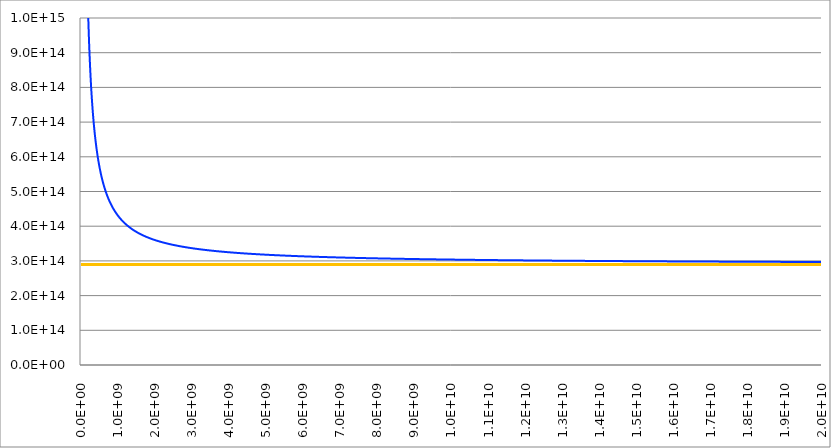
| Category | Series 1 | Series 0 | Series 2 | Series 3 |
|---|---|---|---|---|
| 0.0 |  |  | 9460730472580800 | 289759260980622 |
| 10000000.0 |  |  | 6940371603818580 | 289759260980622 |
| 20000000.0 |  |  | 5250958978916320 | 289759260980622 |
| 30000000.0 |  |  | 4141010980290260 | 289759260980622 |
| 40000000.0 |  |  | 3394667896250070 | 289759260980622 |
| 50000000.0 |  |  | 2872714647851440 | 289759260980622 |
| 60000000.0 |  |  | 2492768417914960 | 289759260980622 |
| 70000000.0 |  |  | 2206181239357440 | 289759260980622 |
| 80000000.0 |  |  | 1983395692493420 | 289759260980622 |
| 90000000.0 |  |  | 1805778403562200 | 289759260980622 |
| 100000000.0 |  |  | 1661141711476920 | 289759260980622 |
| 110000000.0 |  |  | 1541238857798990 | 289759260980622 |
| 120000000.0 |  |  | 1440318104584080 | 289759260980622 |
| 130000000.0 |  |  | 1354259187466300 | 289759260980622 |
| 140000000.0 |  |  | 1280040254891900 | 289759260980622 |
| 150000000.0 |  |  | 1215398567079100 | 289759260980622 |
| 160000000.0 |  |  | 1158608400531650 | 289759260980622 |
| 170000000.0 |  |  | 1108331944488980 | 289759260980622 |
| 180000000.0 |  |  | 1063516885940020 | 289759260980622 |
| 190000000.0 |  |  | 1023324596046940 | 289759260980622 |
| 200000000.0 |  |  | 987078824555616 | 289759260980622 |
| 210000000.0 |  |  | 954228418999640 | 289759260980622 |
| 220000000.0 |  |  | 924319813813488 | 289759260980622 |
| 230000000.0 |  |  | 896976441207608 | 289759260980622 |
| 240000000.0 |  |  | 871883122412320 | 289759260980622 |
| 250000000.0 |  |  | 848774093707264 | 289759260980622 |
| 260000000.0 |  |  | 827423720154176 | 289759260980622 |
| 270000000.0 |  |  | 807639220895072 | 289759260980622 |
| 280000000.0 |  |  | 789254916915488 | 289759260980622 |
| 290000000.0 |  |  | 772127643125392 | 289759260980622 |
| 300000000.0 |  |  | 756133059506064 | 289759260980622 |
| 310000000.0 |  |  | 741162662781840 | 289759260980622 |
| 320000000.0 |  |  | 727121348532128 | 289759260980622 |
| 330000000.0 |  |  | 713925409235968 | 289759260980622 |
| 340000000.0 |  |  | 701500880122128 | 289759260980622 |
| 350000000.0 |  |  | 689782164447776 | 289759260980622 |
| 360000000.0 |  |  | 678710884743840 | 289759260980622 |
| 370000000.0 |  |  | 668234917923184 | 289759260980622 |
| 380000000.0 |  |  | 658307580866640 | 289759260980622 |
| 390000000.0 |  |  | 648886939844368 | 289759260980622 |
| 400000000.0 |  |  | 639935222378784 | 289759260980622 |
| 410000000.0 |  |  | 631418314273120 | 289759260980622 |
| 420000000.0 |  |  | 623305327775328 | 289759260980622 |
| 430000000.0 |  |  | 615568229425264 | 289759260980622 |
| 440000000.0 |  |  | 608181518189552 | 289759260980622 |
| 450000000.0 |  |  | 601121946140768 | 289759260980622 |
| 460000000.0 |  |  | 594368275268032 | 289759260980622 |
| 470000000.0 |  |  | 587901065087584 | 289759260980622 |
| 480000000.0 |  |  | 581702486601088 | 289759260980622 |
| 490000000.0 |  |  | 575756158869088 | 289759260980622 |
| 500000000.0 |  |  | 570047005058944 | 289759260980622 |
| 510000000.0 |  |  | 564561125315424 | 289759260980622 |
| 520000000.0 |  |  | 559285684205696 | 289759260980622 |
| 530000000.0 |  |  | 554208810827648 | 289759260980622 |
| 540000000.0 |  |  | 549319509951584 | 289759260980622 |
| 550000000.0 |  |  | 544607582799712 | 289759260980622 |
| 560000000.0 |  |  | 540063556267232 | 289759260980622 |
| 570000000.0 |  |  | 535678619553568 | 289759260980622 |
| 580000000.0 |  |  | 531444567316352 | 289759260980622 |
| 590000000.0 |  |  | 527353748576480 | 289759260980622 |
| 600000000.0 |  |  | 523399020709152 | 289759260980622 |
| 610000000.0 |  |  | 519573707939360 | 289759260980622 |
| 620000000.0 |  |  | 515871563835296 | 289759260980622 |
| 630000000.0 |  |  | 512286737359200 | 289759260980622 |
| 640000000.0 |  |  | 508813742086976 | 289759260980622 |
| 650000000.0 |  |  | 505447428258016 | 289759260980622 |
| 660000000.0 |  |  | 502182957355392 | 289759260980622 |
| 670000000.0 |  |  | 499015778954368 | 289759260980622 |
| 680000000.0 |  |  | 495941609605696 | 289759260980622 |
| 690000000.0 |  |  | 492956413548544 | 289759260980622 |
| 700000000.0 |  |  | 490056385071328 | 289759260980622 |
| 710000000.0 |  |  | 487237932357376 | 289759260980622 |
| 720000000.0 |  |  | 484497662672992 | 289759260980622 |
| 730000000.0 |  |  | 481832368768704 | 289759260980622 |
| 740000000.0 |  |  | 479239016379776 | 289759260980622 |
| 750000000.0 |  |  | 476714732723616 | 289759260980622 |
| 760000000.0 |  |  | 474256795902624 | 289759260980622 |
| 770000000.0 |  |  | 471862625130464 | 289759260980622 |
| 780000000.0 |  |  | 469529771707840 | 289759260980622 |
| 790000000.0 |  |  | 467255910682368 | 289759260980622 |
| 800000000.0 |  |  | 465038833131264 | 289759260980622 |
| 810000000.0 |  |  | 462876439015488 | 289759260980622 |
| 820000000.0 |  |  | 460766730554240 | 289759260980622 |
| 830000000.0 |  |  | 458707806078112 | 289759260980622 |
| 840000000.0 |  |  | 456697854319648 | 289759260980622 |
| 850000000.0 |  |  | 454735149106368 | 289759260980622 |
| 860000000.0 |  |  | 452818044423104 | 289759260980622 |
| 870000000.0 |  |  | 450944969813728 | 289759260980622 |
| 880000000.0 |  |  | 449114426096448 | 289759260980622 |
| 890000000.0 |  |  | 447324981366688 | 289759260980622 |
| 900000000.0 |  |  | 445575267266144 | 289759260980622 |
| 910000000.0 |  |  | 443863975497312 | 289759260980622 |
| 920000000.0 |  |  | 442189854564992 | 289759260980622 |
| 930000000.0 |  |  | 440551706727200 | 289759260980622 |
| 940000000.0 |  |  | 438948385141088 | 289759260980622 |
| 950000000.0 |  |  | 437378791187808 | 289759260980622 |
| 960000000.0 |  |  | 435841871965056 | 289759260980622 |
| 970000000.0 |  |  | 434336617934208 | 289759260980622 |
| 980000000.0 |  |  | 432862060711168 | 289759260980622 |
| 990000000.0 |  |  | 431417270990464 | 289759260980622 |
| 1000000000.0 |  |  | 430001356595008 | 289759260980622 |
| 1010000000.0 |  |  | 428613460639616 | 289759260980622 |
| 1020000000.0 |  |  | 427252759804480 | 289759260980622 |
| 1030000000.0 |  |  | 425918462707264 | 289759260980622 |
| 1040000000.0 |  |  | 424609808369408 | 289759260980622 |
| 1050000000.0 |  |  | 423326064771456 | 289759260980622 |
| 1060000000.0 |  |  | 422066527487552 | 289759260980622 |
| 1070000000.0 |  |  | 420830518398016 | 289759260980622 |
| 1080000000.0 |  |  | 419617384473472 | 289759260980622 |
| 1090000000.0 |  |  | 418426496624768 | 289759260980622 |
| 1100000000.0 |  |  | 417257248615872 | 289759260980622 |
| 1110000000.0 |  |  | 416109056036480 | 289759260980622 |
| 1120000000.0 |  |  | 414981355328000 | 289759260980622 |
| 1130000000.0 |  |  | 413873602862080 | 289759260980622 |
| 1140000000.0 |  |  | 412785274068096 | 289759260980622 |
| 1150000000.0 |  |  | 411715862604416 | 289759260980622 |
| 1160000000.0 |  |  | 410664879574272 | 289759260980622 |
| 1170000000.0 |  |  | 409631852780736 | 289759260980622 |
| 1180000000.0 |  |  | 408616326020096 | 289759260980622 |
| 1190000000.0 |  |  | 407617858409792 | 289759260980622 |
| 1200000000.0 |  |  | 406636023751872 | 289759260980622 |
| 1210000000.0 |  |  | 405670409925696 | 289759260980622 |
| 1220000000.0 |  |  | 404720618312192 | 289759260980622 |
| 1230000000.0 |  |  | 403786263245248 | 289759260980622 |
| 1240000000.0 |  |  | 402866971489856 | 289759260980622 |
| 1250000000.0 |  |  | 401962381745728 | 289759260980622 |
| 1260000000.0 |  |  | 401072144173632 | 289759260980622 |
| 1270000000.0 |  |  | 400195919944960 | 289759260980622 |
| 1280000000.0 |  |  | 399333380811392 | 289759260980622 |
| 1290000000.0 |  |  | 398484208696192 | 289759260980622 |
| 1300000000.0 |  |  | 397648095302400 | 289759260980622 |
| 1310000000.0 |  |  | 396824741739968 | 289759260980622 |
| 1320000000.0 |  |  | 396013858170432 | 289759260980622 |
| 1330000000.0 |  |  | 395215163466176 | 289759260980622 |
| 1340000000.0 |  |  | 394428384885824 | 289759260980622 |
| 1350000000.0 |  |  | 393653257764160 | 289759260980622 |
| 1360000000.0 |  |  | 392889525215104 | 289759260980622 |
| 1370000000.0 |  |  | 392136937848064 | 289759260980622 |
| 1380000000.0 |  |  | 391395253496960 | 289759260980622 |
| 1390000000.0 |  |  | 390664236960128 | 289759260980622 |
| 1400000000.0 |  |  | 389943659751616 | 289759260980622 |
| 1410000000.0 |  |  | 389233299863744 | 289759260980622 |
| 1420000000.0 |  |  | 388532941538944 | 289759260980622 |
| 1430000000.0 |  |  | 387842375051136 | 289759260980622 |
| 1440000000.0 |  |  | 387161396496704 | 289759260980622 |
| 1450000000.0 |  |  | 386489807593920 | 289759260980622 |
| 1460000000.0 |  |  | 385827415490112 | 289759260980622 |
| 1470000000.0 |  |  | 385174032577600 | 289759260980622 |
| 1480000000.0 |  |  | 384529476316608 | 289759260980622 |
| 1490000000.0 |  |  | 383893569064832 | 289759260980622 |
| 1500000000.0 |  |  | 383266137914688 | 289759260980622 |
| 1510000000.0 |  |  | 382647014536832 | 289759260980622 |
| 1520000000.0 |  |  | 382036035028800 | 289759260980622 |
| 1530000000.0 |  |  | 381433039771456 | 289759260980622 |
| 1540000000.0 |  |  | 380837873289536 | 289759260980622 |
| 1550000000.0 |  |  | 380250384117696 | 289759260980622 |
| 1560000000.0 |  |  | 379670424672832 | 289759260980622 |
| 1570000000.0 |  |  | 379097851129984 | 289759260980622 |
| 1580000000.0 |  |  | 378532523303360 | 289759260980622 |
| 1590000000.0 |  |  | 377974304532544 | 289759260980622 |
| 1600000000.0 |  |  | 377423061571968 | 289759260980622 |
| 1610000000.0 |  |  | 376878664484736 | 289759260980622 |
| 1620000000.0 |  |  | 376340986541248 | 289759260980622 |
| 1630000000.0 |  |  | 375809904120064 | 289759260980622 |
| 1640000000.0 |  |  | 375285296613888 | 289759260980622 |
| 1650000000.0 |  |  | 374767046337664 | 289759260980622 |
| 1660000000.0 |  |  | 374255038441216 | 289759260980622 |
| 1670000000.0 |  |  | 373749160823744 | 289759260980622 |
| 1680000000.0 |  |  | 373249304052864 | 289759260980622 |
| 1690000000.0 |  |  | 372755361284736 | 289759260980622 |
| 1700000000.0 |  |  | 372267228188736 | 289759260980622 |
| 1710000000.0 |  |  | 371784802873728 | 289759260980622 |
| 1720000000.0 |  |  | 371307985817216 | 289759260980622 |
| 1730000000.0 |  |  | 370836679796736 | 289759260980622 |
| 1740000000.0 |  |  | 370370789824064 | 289759260980622 |
| 1750000000.0 |  |  | 369910223081216 | 289759260980622 |
| 1760000000.0 |  |  | 369454888859008 | 289759260980622 |
| 1770000000.0 |  |  | 369004698497344 | 289759260980622 |
| 1780000000.0 |  |  | 368559565328000 | 289759260980622 |
| 1790000000.0 |  |  | 368119404618176 | 289759260980622 |
| 1800000000.0 |  |  | 367684133517760 | 289759260980622 |
| 1810000000.0 |  |  | 367253671007040 | 289759260980622 |
| 1820000000.0 |  |  | 366827937845824 | 289759260980622 |
| 1830000000.0 |  |  | 366406856525824 | 289759260980622 |
| 1840000000.0 |  |  | 365990351222976 | 289759260980622 |
| 1850000000.0 |  |  | 365578347751872 | 289759260980622 |
| 1860000000.0 |  |  | 365170773522240 | 289759260980622 |
| 1870000000.0 |  |  | 364767557495872 | 289759260980622 |
| 1880000000.0 |  |  | 364368630145536 | 289759260980622 |
| 1890000000.0 |  |  | 363973923414912 | 289759260980622 |
| 1900000000.0 |  |  | 363583370680256 | 289759260980622 |
| 1910000000.0 |  |  | 363196906712064 | 289759260980622 |
| 1920000000.0 |  |  | 362814467640000 | 289759260980622 |
| 1930000000.0 |  |  | 362435990916736 | 289759260980622 |
| 1940000000.0 |  |  | 362061415283968 | 289759260980622 |
| 1950000000.0 |  |  | 361690680740096 | 289759260980622 |
| 1960000000.0 |  |  | 361323728507136 | 289759260980622 |
| 1970000000.0 |  |  | 360960501000448 | 289759260980622 |
| 1980000000.0 |  |  | 360600941798400 | 289759260980622 |
| 1990000000.0 |  |  | 360244995613440 | 289759260980622 |
| 2000000000.0 |  |  | 359892608262400 | 289759260980622 |
| 2010000000.0 |  |  | 359543726641152 | 289759260980622 |
| 2020000000.0 |  |  | 359198298696448 | 289759260980622 |
| 2030000000.0 |  |  | 358856273400576 | 289759260980622 |
| 2040000000.0 |  |  | 358517600725248 | 289759260980622 |
| 2050000000.0 |  |  | 358182231619328 | 289759260980622 |
| 2060000000.0 |  |  | 357850117983232 | 289759260980622 |
| 2070000000.0 |  |  | 357521212646144 | 289759260980622 |
| 2080000000.0 |  |  | 357195469345280 | 289759260980622 |
| 2090000000.0 |  |  | 356872842702080 | 289759260980622 |
| 2100000000.0 |  |  | 356553288201984 | 289759260980622 |
| 2110000000.0 |  |  | 356236762174976 | 289759260980622 |
| 2120000000.0 |  |  | 355923221774080 | 289759260980622 |
| 2130000000.0 |  |  | 355612624956928 | 289759260980622 |
| 2140000000.0 |  |  | 355304930467072 | 289759260980622 |
| 2150000000.0 |  |  | 355000097815040 | 289759260980622 |
| 2160000000.0 |  |  | 354698087260672 | 289759260980622 |
| 2170000000.0 |  |  | 354398859797248 | 289759260980622 |
| 2180000000.0 |  |  | 354102377132800 | 289759260980622 |
| 2190000000.0 |  |  | 353808601674240 | 289759260980622 |
| 2200000000.0 |  |  | 353517496513024 | 289759260980622 |
| 2210000000.0 |  |  | 353229025407232 | 289759260980622 |
| 2220000000.0 |  |  | 352943152768512 | 289759260980622 |
| 2230000000.0 |  |  | 352659843646720 | 289759260980622 |
| 2240000000.0 |  |  | 352379063715072 | 289759260980622 |
| 2250000000.0 |  |  | 352100779257856 | 289759260980622 |
| 2260000000.0 |  |  | 351824957154816 | 289759260980622 |
| 2270000000.0 |  |  | 351551564870144 | 289759260980622 |
| 2280000000.0 |  |  | 351280570438144 | 289759260980622 |
| 2290000000.0 |  |  | 351011942451712 | 289759260980622 |
| 2300000000.0 |  |  | 350745650049536 | 289759260980622 |
| 2310000000.0 |  |  | 350481662904832 | 289759260980622 |
| 2320000000.0 |  |  | 350219951213312 | 289759260980622 |
| 2330000000.0 |  |  | 349960485682688 | 289759260980622 |
| 2340000000.0 |  |  | 349703237520128 | 289759260980622 |
| 2350000000.0 |  |  | 349448178424832 | 289759260980622 |
| 2360000000.0 |  |  | 349195280573440 | 289759260980622 |
| 2370000000.0 |  |  | 348944516613376 | 289759260980622 |
| 2380000000.0 |  |  | 348695859651584 | 289759260980622 |
| 2390000000.0 |  |  | 348449283244544 | 289759260980622 |
| 2400000000.0 |  |  | 348204761389056 | 289759260980622 |
| 2410000000.0 |  |  | 347962268514560 | 289759260980622 |
| 2420000000.0 |  |  | 347721779472640 | 289759260980622 |
| 2430000000.0 |  |  | 347483269527552 | 289759260980622 |
| 2440000000.0 |  |  | 347246714351104 | 289759260980622 |
| 2450000000.0 |  |  | 347012090010624 | 289759260980622 |
| 2460000000.0 |  |  | 346779372962816 | 289759260980622 |
| 2470000000.0 |  |  | 346548540045824 | 289759260980622 |
| 2480000000.0 |  |  | 346319568471552 | 289759260980622 |
| 2490000000.0 |  |  | 346092435817216 | 289759260980622 |
| 2500000000.0 |  |  | 345867120019456 | 289759260980622 |
| 2510000000.0 |  |  | 345643599365888 | 289759260980622 |
| 2520000000.0 |  |  | 345421852488960 | 289759260980622 |
| 2530000000.0 |  |  | 345201858358784 | 289759260980622 |
| 2540000000.0 |  |  | 344983596276736 | 289759260980622 |
| 2550000000.0 |  |  | 344767045868544 | 289759260980622 |
| 2560000000.0 |  |  | 344552187078656 | 289759260980622 |
| 2570000000.0 |  |  | 344339000163072 | 289759260980622 |
| 2580000000.0 |  |  | 344127465684480 | 289759260980622 |
| 2590000000.0 |  |  | 343917564505088 | 289759260980622 |
| 2600000000.0 |  |  | 343709277782016 | 289759260980622 |
| 2610000000.0 |  |  | 343502586960640 | 289759260980622 |
| 2620000000.0 |  |  | 343297473769984 | 289759260980622 |
| 2630000000.0 |  |  | 343093920216576 | 289759260980622 |
| 2640000000.0 |  |  | 342891908579584 | 289759260980622 |
| 2650000000.0 |  |  | 342691421405952 | 289759260980622 |
| 2660000000.0 |  |  | 342492441504512 | 289759260980622 |
| 2670000000.0 |  |  | 342294951941888 | 289759260980622 |
| 2680000000.0 |  |  | 342098936037376 | 289759260980622 |
| 2690000000.0 |  |  | 341904377358592 | 289759260980622 |
| 2700000000.0 |  |  | 341711259715840 | 289759260980622 |
| 2710000000.0 |  |  | 341519567158784 | 289759260980622 |
| 2720000000.0 |  |  | 341329283971840 | 289759260980622 |
| 2730000000.0 |  |  | 341140394668800 | 289759260980622 |
| 2740000000.0 |  |  | 340952883990528 | 289759260980622 |
| 2750000000.0 |  |  | 340766736899328 | 289759260980622 |
| 2760000000.0 |  |  | 340581938575360 | 289759260980622 |
| 2770000000.0 |  |  | 340398474413056 | 289759260980622 |
| 2780000000.0 |  |  | 340216330016256 | 289759260980622 |
| 2790000000.0 |  |  | 340035491195904 | 289759260980622 |
| 2800000000.0 |  |  | 339855943965696 | 289759260980622 |
| 2810000000.0 |  |  | 339677674537216 | 289759260980622 |
| 2820000000.0 |  |  | 339500669319424 | 289759260980622 |
| 2830000000.0 |  |  | 339324914911744 | 289759260980622 |
| 2840000000.0 |  |  | 339150398103040 | 289759260980622 |
| 2850000000.0 |  |  | 338977105867520 | 289759260980622 |
| 2860000000.0 |  |  | 338805025361408 | 289759260980622 |
| 2870000000.0 |  |  | 338634143920128 | 289759260980622 |
| 2880000000.0 |  |  | 338464449054720 | 289759260980622 |
| 2890000000.0 |  |  | 338295928449280 | 289759260980622 |
| 2900000000.0 |  |  | 338128569957632 | 289759260980622 |
| 2910000000.0 |  |  | 337962361600512 | 289759260980622 |
| 2920000000.0 |  |  | 337797291562752 | 289759260980622 |
| 2930000000.0 |  |  | 337633348190464 | 289759260980622 |
| 2940000000.0 |  |  | 337470519988224 | 289759260980622 |
| 2950000000.0 |  |  | 337308795616768 | 289759260980622 |
| 2960000000.0 |  |  | 337148163889920 | 289759260980622 |
| 2970000000.0 |  |  | 336988613771520 | 289759260980622 |
| 2980000000.0 |  |  | 336830134374656 | 289759260980622 |
| 2990000000.0 |  |  | 336672714957056 | 289759260980622 |
| 3000000000.0 |  |  | 336516344920064 | 289759260980622 |
| 3010000000.0 |  |  | 336361013806080 | 289759260980622 |
| 3020000000.0 |  |  | 336206711295488 | 289759260980622 |
| 3030000000.0 |  |  | 336053427205120 | 289759260980622 |
| 3040000000.0 |  |  | 335901151485952 | 289759260980622 |
| 3050000000.0 |  |  | 335749874220544 | 289759260980622 |
| 3060000000.0 |  |  | 335599585620736 | 289759260980622 |
| 3070000000.0 |  |  | 335450276027136 | 289759260980622 |
| 3080000000.0 |  |  | 335301935904256 | 289759260980622 |
| 3090000000.0 |  |  | 335154555840512 | 289759260980622 |
| 3100000000.0 |  |  | 335008126546432 | 289759260980622 |
| 3110000000.0 |  |  | 334862638851328 | 289759260980622 |
| 3120000000.0 |  |  | 334718083702016 | 289759260980622 |
| 3130000000.0 |  |  | 334574452161792 | 289759260980622 |
| 3140000000.0 |  |  | 334431735406336 | 289759260980622 |
| 3150000000.0 |  |  | 334289924724992 | 289759260980622 |
| 3160000000.0 |  |  | 334149011516160 | 289759260980622 |
| 3170000000.0 |  |  | 334008987287552 | 289759260980622 |
| 3180000000.0 |  |  | 333869843653120 | 289759260980622 |
| 3190000000.0 |  |  | 333731572332288 | 289759260980622 |
| 3200000000.0 |  |  | 333594165147648 | 289759260980622 |
| 3210000000.0 |  |  | 333457614023936 | 289759260980622 |
| 3220000000.0 |  |  | 333321910986496 | 289759260980622 |
| 3230000000.0 |  |  | 333187048158720 | 289759260980622 |
| 3240000000.0 |  |  | 333053017761792 | 289759260980622 |
| 3250000000.0 |  |  | 332919812112384 | 289759260980622 |
| 3260000000.0 |  |  | 332787423621376 | 289759260980622 |
| 3270000000.0 |  |  | 332655844792320 | 289759260980622 |
| 3280000000.0 |  |  | 332525068221184 | 289759260980622 |
| 3290000000.0 |  |  | 332395086592256 | 289759260980622 |
| 3300000000.0 |  |  | 332265892680192 | 289759260980622 |
| 3310000000.0 |  |  | 332137479345664 | 289759260980622 |
| 3320000000.0 |  |  | 332009839536128 | 289759260980622 |
| 3330000000.0 |  |  | 331882966283264 | 289759260980622 |
| 3340000000.0 |  |  | 331756852702464 | 289759260980622 |
| 3350000000.0 |  |  | 331631491991808 | 289759260980622 |
| 3360000000.0 |  |  | 331506877428736 | 289759260980622 |
| 3370000000.0 |  |  | 331383002372352 | 289759260980622 |
| 3380000000.0 |  |  | 331259860259584 | 289759260980622 |
| 3390000000.0 |  |  | 331137444604160 | 289759260980622 |
| 3400000000.0 |  |  | 331015748997120 | 289759260980622 |
| 3410000000.0 |  |  | 330894767104000 | 289759260980622 |
| 3420000000.0 |  |  | 330774492664576 | 289759260980622 |
| 3430000000.0 |  |  | 330654919492352 | 289759260980622 |
| 3440000000.0 |  |  | 330536041471232 | 289759260980622 |
| 3450000000.0 |  |  | 330417852557568 | 289759260980622 |
| 3460000000.0 |  |  | 330300346776576 | 289759260980622 |
| 3470000000.0 |  |  | 330183518222592 | 289759260980622 |
| 3480000000.0 |  |  | 330067361058048 | 289759260980622 |
| 3490000000.0 |  |  | 329951869512448 | 289759260980622 |
| 3500000000.0 |  |  | 329837037880320 | 289759260980622 |
| 3510000000.0 |  |  | 329722860521984 | 289759260980622 |
| 3520000000.0 |  |  | 329609331862016 | 289759260980622 |
| 3530000000.0 |  |  | 329496446387712 | 289759260980622 |
| 3540000000.0 |  |  | 329384198648576 | 289759260980622 |
| 3550000000.0 |  |  | 329272583255552 | 289759260980622 |
| 3560000000.0 |  |  | 329161594880768 | 289759260980622 |
| 3570000000.0 |  |  | 329051228254976 | 289759260980622 |
| 3580000000.0 |  |  | 328941478168832 | 289759260980622 |
| 3590000000.0 |  |  | 328832339470336 | 289759260980622 |
| 3600000000.0 |  |  | 328723807065088 | 289759260980622 |
| 3610000000.0 |  |  | 328615875914752 | 289759260980622 |
| 3620000000.0 |  |  | 328508541037312 | 289759260980622 |
| 3630000000.0 |  |  | 328401797504768 | 289759260980622 |
| 3640000000.0 |  |  | 328295640444160 | 289759260980622 |
| 3650000000.0 |  |  | 328190065035520 | 289759260980622 |
| 3660000000.0 |  |  | 328085066511104 | 289759260980622 |
| 3670000000.0 |  |  | 327980640155904 | 289759260980622 |
| 3680000000.0 |  |  | 327876781305856 | 289759260980622 |
| 3690000000.0 |  |  | 327773485347072 | 289759260980622 |
| 3700000000.0 |  |  | 327670747716352 | 289759260980622 |
| 3710000000.0 |  |  | 327568563899136 | 289759260980622 |
| 3720000000.0 |  |  | 327466929428736 | 289759260980622 |
| 3730000000.0 |  |  | 327365839888384 | 289759260980622 |
| 3740000000.0 |  |  | 327265290906368 | 289759260980622 |
| 3750000000.0 |  |  | 327165278158592 | 289759260980622 |
| 3760000000.0 |  |  | 327065797367296 | 289759260980622 |
| 3770000000.0 |  |  | 326966844299264 | 289759260980622 |
| 3780000000.0 |  |  | 326868414766592 | 289759260980622 |
| 3790000000.0 |  |  | 326770504625664 | 289759260980622 |
| 3800000000.0 |  |  | 326673109776128 | 289759260980622 |
| 3810000000.0 |  |  | 326576226160640 | 289759260980622 |
| 3820000000.0 |  |  | 326479849765120 | 289759260980622 |
| 3830000000.0 |  |  | 326383976616192 | 289759260980622 |
| 3840000000.0 |  |  | 326288602782976 | 289759260980622 |
| 3850000000.0 |  |  | 326193724374784 | 289759260980622 |
| 3860000000.0 |  |  | 326099337541120 | 289759260980622 |
| 3870000000.0 |  |  | 326005438471680 | 289759260980622 |
| 3880000000.0 |  |  | 325912023395584 | 289759260980622 |
| 3890000000.0 |  |  | 325819088580608 | 289759260980622 |
| 3900000000.0 |  |  | 325726630331904 | 289759260980622 |
| 3910000000.0 |  |  | 325634644993792 | 289759260980622 |
| 3920000000.0 |  |  | 325543128947456 | 289759260980622 |
| 3930000000.0 |  |  | 325452078610176 | 289759260980622 |
| 3940000000.0 |  |  | 325361490436352 | 289759260980622 |
| 3950000000.0 |  |  | 325271360915968 | 289759260980622 |
| 3960000000.0 |  |  | 325181686575104 | 289759260980622 |
| 3970000000.0 |  |  | 325092463973888 | 289759260980622 |
| 3980000000.0 |  |  | 325003689707520 | 289759260980622 |
| 3990000000.0 |  |  | 324915360405248 | 289759260980622 |
| 4000000000.0 |  |  | 324827472730112 | 289759260980622 |
| 4010000000.0 |  |  | 324740023377920 | 289759260980622 |
| 4020000000.0 |  |  | 324653009078784 | 289759260980622 |
| 4030000000.0 |  |  | 324566426593536 | 289759260980622 |
| 4040000000.0 |  |  | 324480272715776 | 289759260980622 |
| 4050000000.0 |  |  | 324394544271360 | 289759260980622 |
| 4060000000.0 |  |  | 324309238116096 | 289759260980622 |
| 4070000000.0 |  |  | 324224351138048 | 289759260980622 |
| 4080000000.0 |  |  | 324139880255232 | 289759260980622 |
| 4090000000.0 |  |  | 324055822415360 | 289759260980622 |
| 4100000000.0 |  |  | 323972174596608 | 289759260980622 |
| 4110000000.0 |  |  | 323888933806336 | 289759260980622 |
| 4120000000.0 |  |  | 323806097080832 | 289759260980622 |
| 4130000000.0 |  |  | 323723661485056 | 289759260980622 |
| 4140000000.0 |  |  | 323641624112640 | 289759260980622 |
| 4150000000.0 |  |  | 323559982084864 | 289759260980622 |
| 4160000000.0 |  |  | 323478732550912 | 289759260980622 |
| 4170000000.0 |  |  | 323397872687360 | 289759260980622 |
| 4180000000.0 |  |  | 323317399697408 | 289759260980622 |
| 4190000000.0 |  |  | 323237310810880 | 289759260980622 |
| 4200000000.0 |  |  | 323157603285248 | 289759260980622 |
| 4210000000.0 |  |  | 323078274402560 | 289759260980622 |
| 4220000000.0 |  |  | 322999321471488 | 289759260980622 |
| 4230000000.0 |  |  | 322920741825536 | 289759260980622 |
| 4240000000.0 |  |  | 322842532823808 | 289759260980622 |
| 4250000000.0 |  |  | 322764691849728 | 289759260980622 |
| 4260000000.0 |  |  | 322687216312320 | 289759260980622 |
| 4270000000.0 |  |  | 322610103644160 | 289759260980622 |
| 4280000000.0 |  |  | 322533351301888 | 289759260980622 |
| 4290000000.0 |  |  | 322456956765440 | 289759260980622 |
| 4300000000.0 |  |  | 322380917538816 | 289759260980622 |
| 4310000000.0 |  |  | 322305231149056 | 289759260980622 |
| 4320000000.0 |  |  | 322229895145984 | 289759260980622 |
| 4330000000.0 |  |  | 322154907102464 | 289759260980622 |
| 4340000000.0 |  |  | 322080264613120 | 289759260980622 |
| 4350000000.0 |  |  | 322005965294592 | 289759260980622 |
| 4360000000.0 |  |  | 321932006786304 | 289759260980622 |
| 4370000000.0 |  |  | 321858386747904 | 289759260980622 |
| 4380000000.0 |  |  | 321785102862080 | 289759260980622 |
| 4390000000.0 |  |  | 321712152831232 | 289759260980622 |
| 4400000000.0 |  |  | 321639534379776 | 289759260980622 |
| 4410000000.0 |  |  | 321567245251584 | 289759260980622 |
| 4420000000.0 |  |  | 321495283211776 | 289759260980622 |
| 4430000000.0 |  |  | 321423646045184 | 289759260980622 |
| 4440000000.0 |  |  | 321352331557120 | 289759260980622 |
| 4450000000.0 |  |  | 321281337572352 | 289759260980622 |
| 4460000000.0 |  |  | 321210661934848 | 289759260980622 |
| 4470000000.0 |  |  | 321140302508544 | 289759260980622 |
| 4480000000.0 |  |  | 321070257175808 | 289759260980622 |
| 4490000000.0 |  |  | 321000523837440 | 289759260980622 |
| 4500000000.0 |  |  | 320931100414976 | 289759260980622 |
| 4510000000.0 |  |  | 320861984846080 | 289759260980622 |
| 4520000000.0 |  |  | 320793175087616 | 289759260980622 |
| 4530000000.0 |  |  | 320724669114880 | 289759260980622 |
| 4540000000.0 |  |  | 320656464920064 | 289759260980622 |
| 4550000000.0 |  |  | 320588560513792 | 289759260980622 |
| 4560000000.0 |  |  | 320520953923840 | 289759260980622 |
| 4570000000.0 |  |  | 320453643195136 | 289759260980622 |
| 4580000000.0 |  |  | 320386626389760 | 289759260980622 |
| 4590000000.0 |  |  | 320319901587200 | 289759260980622 |
| 4600000000.0 |  |  | 320253466882560 | 289759260980622 |
| 4610000000.0 |  |  | 320187320388096 | 289759260980622 |
| 4620000000.0 |  |  | 320121460232960 | 289759260980622 |
| 4630000000.0 |  |  | 320055884561920 | 289759260980622 |
| 4640000000.0 |  |  | 319990591534848 | 289759260980622 |
| 4650000000.0 |  |  | 319925579329280 | 289759260980622 |
| 4660000000.0 |  |  | 319860846136832 | 289759260980622 |
| 4670000000.0 |  |  | 319796390165248 | 289759260980622 |
| 4680000000.0 |  |  | 319732209637632 | 289759260980622 |
| 4690000000.0 |  |  | 319668302792704 | 289759260980622 |
| 4700000000.0 |  |  | 319604667882752 | 289759260980622 |
| 4710000000.0 |  |  | 319541303176448 | 289759260980622 |
| 4720000000.0 |  |  | 319478206956032 | 289759260980622 |
| 4730000000.0 |  |  | 319415377518592 | 289759260980622 |
| 4740000000.0 |  |  | 319352813176320 | 289759260980622 |
| 4750000000.0 |  |  | 319290512254464 | 289759260980622 |
| 4760000000.0 |  |  | 319228473093120 | 289759260980622 |
| 4770000000.0 |  |  | 319166694045952 | 289759260980622 |
| 4780000000.0 |  |  | 319105173480960 | 289759260980622 |
| 4790000000.0 |  |  | 319043909778432 | 289759260980622 |
| 4800000000.0 |  |  | 318982901333504 | 289759260980622 |
| 4810000000.0 |  |  | 318922146554368 | 289759260980622 |
| 4820000000.0 |  |  | 318861643862528 | 289759260980622 |
| 4830000000.0 |  |  | 318801391691520 | 289759260980622 |
| 4840000000.0 |  |  | 318741388488960 | 289759260980622 |
| 4850000000.0 |  |  | 318681632714752 | 289759260980622 |
| 4860000000.0 |  |  | 318622122841856 | 289759260980622 |
| 4870000000.0 |  |  | 318562857355520 | 289759260980622 |
| 4880000000.0 |  |  | 318503834753536 | 289759260980622 |
| 4890000000.0 |  |  | 318445053545472 | 289759260980622 |
| 4900000000.0 |  |  | 318386512253440 | 289759260980622 |
| 4910000000.0 |  |  | 318328209411840 | 289759260980622 |
| 4920000000.0 |  |  | 318270143567360 | 289759260980622 |
| 4930000000.0 |  |  | 318212313276928 | 289759260980622 |
| 4940000000.0 |  |  | 318154717110272 | 289759260980622 |
| 4950000000.0 |  |  | 318097353649152 | 289759260980622 |
| 4960000000.0 |  |  | 318040221485568 | 289759260980622 |
| 4970000000.0 |  |  | 317983319223296 | 289759260980622 |
| 4980000000.0 |  |  | 317926645477888 | 289759260980622 |
| 4990000000.0 |  |  | 317870198875392 | 289759260980622 |
| 5000000000.0 |  |  | 317813978052864 | 289759260980622 |
| 5010000000.0 |  |  | 317757981658624 | 289759260980622 |
| 5020000000.0 |  |  | 317702208351232 | 289759260980622 |
| 5030000000.0 |  |  | 317646656800256 | 289759260980622 |
| 5040000000.0 |  |  | 317591325686016 | 289759260980622 |
| 5050000000.0 |  |  | 317536213698816 | 289759260980622 |
| 5060000000.0 |  |  | 317481319539456 | 289759260980622 |
| 5070000000.0 |  |  | 317426641919232 | 289759260980622 |
| 5080000000.0 |  |  | 317372179559424 | 289759260980622 |
| 5090000000.0 |  |  | 317317931191040 | 289759260980622 |
| 5100000000.0 |  |  | 317263895555840 | 289759260980622 |
| 5110000000.0 |  |  | 317210071404800 | 289759260980622 |
| 5120000000.0 |  |  | 317156457498368 | 289759260980622 |
| 5130000000.0 |  |  | 317103052607744 | 289759260980622 |
| 5140000000.0 |  |  | 317049855512832 | 289759260980622 |
| 5150000000.0 |  |  | 316996865002496 | 289759260980622 |
| 5160000000.0 |  |  | 316944079876864 | 289759260980622 |
| 5170000000.0 |  |  | 316891498943488 | 289759260980622 |
| 5180000000.0 |  |  | 316839121019904 | 289759260980622 |
| 5190000000.0 |  |  | 316786944932864 | 289759260980622 |
| 5200000000.0 |  |  | 316734969518080 | 289759260980622 |
| 5210000000.0 |  |  | 316683193619200 | 289759260980622 |
| 5220000000.0 |  |  | 316631616090880 | 289759260980622 |
| 5230000000.0 |  |  | 316580235794432 | 289759260980622 |
| 5240000000.0 |  |  | 316529051601152 | 289759260980622 |
| 5250000000.0 |  |  | 316478062390528 | 289759260980622 |
| 5260000000.0 |  |  | 316427267049728 | 289759260980622 |
| 5270000000.0 |  |  | 316376664475904 | 289759260980622 |
| 5280000000.0 |  |  | 316326253573632 | 289759260980622 |
| 5290000000.0 |  |  | 316276033256192 | 289759260980622 |
| 5300000000.0 |  |  | 316226002444800 | 289759260980622 |
| 5310000000.0 |  |  | 316176160068352 | 289759260980622 |
| 5320000000.0 |  |  | 316126505064704 | 289759260980622 |
| 5330000000.0 |  |  | 316077036378880 | 289759260980622 |
| 5340000000.0 |  |  | 316027752964608 | 289759260980622 |
| 5350000000.0 |  |  | 315978653783296 | 289759260980622 |
| 5360000000.0 |  |  | 315929737803008 | 289759260980622 |
| 5370000000.0 |  |  | 315881004001024 | 289759260980622 |
| 5380000000.0 |  |  | 315832451361280 | 289759260980622 |
| 5390000000.0 |  |  | 315784078874624 | 289759260980622 |
| 5400000000.0 |  |  | 315735885541376 | 289759260980622 |
| 5410000000.0 |  |  | 315687870368000 | 289759260980622 |
| 5420000000.0 |  |  | 315640032367872 | 289759260980622 |
| 5430000000.0 |  |  | 315592370562560 | 289759260980622 |
| 5440000000.0 |  |  | 315544883980544 | 289759260980622 |
| 5450000000.0 |  |  | 315497571656448 | 289759260980622 |
| 5460000000.0 |  |  | 315450432634112 | 289759260980622 |
| 5470000000.0 |  |  | 315403465961984 | 289759260980622 |
| 5480000000.0 |  |  | 315356670697472 | 289759260980622 |
| 5490000000.0 |  |  | 315310045903360 | 289759260980622 |
| 5500000000.0 |  |  | 315263590649856 | 289759260980622 |
| 5510000000.0 |  |  | 315217304014080 | 289759260980622 |
| 5520000000.0 |  |  | 315171185079808 | 289759260980622 |
| 5530000000.0 |  |  | 315125232936960 | 289759260980622 |
| 5540000000.0 |  |  | 315079446682624 | 289759260980622 |
| 5550000000.0 |  |  | 315033825420288 | 289759260980622 |
| 5560000000.0 |  |  | 314988368259328 | 289759260980622 |
| 5570000000.0 |  |  | 314943074315776 | 289759260980622 |
| 5580000000.0 |  |  | 314897942712576 | 289759260980622 |
| 5590000000.0 |  |  | 314852972578304 | 289759260980622 |
| 5600000000.0 |  |  | 314808163048448 | 289759260980622 |
| 5610000000.0 |  |  | 314763513263616 | 289759260980622 |
| 5620000000.0 |  |  | 314719022371328 | 289759260980622 |
| 5630000000.0 |  |  | 314674689524480 | 289759260980622 |
| 5640000000.0 |  |  | 314630513883136 | 289759260980622 |
| 5650000000.0 |  |  | 314586494612224 | 289759260980622 |
| 5660000000.0 |  |  | 314542630883072 | 289759260980622 |
| 5670000000.0 |  |  | 314498921872896 | 289759260980622 |
| 5680000000.0 |  |  | 314455366764032 | 289759260980622 |
| 5690000000.0 |  |  | 314411964745216 | 289759260980622 |
| 5700000000.0 |  |  | 314368715011328 | 289759260980622 |
| 5710000000.0 |  |  | 314325616761856 | 289759260980622 |
| 5720000000.0 |  |  | 314282669201920 | 289759260980622 |
| 5730000000.0 |  |  | 314239871543296 | 289759260980622 |
| 5740000000.0 |  |  | 314197223002112 | 289759260980622 |
| 5750000000.0 |  |  | 314154722800640 | 289759260980622 |
| 5760000000.0 |  |  | 314112370166016 | 289759260980622 |
| 5770000000.0 |  |  | 314070164331264 | 289759260980622 |
| 5780000000.0 |  |  | 314028104534528 | 289759260980622 |
| 5790000000.0 |  |  | 313986190018816 | 289759260980622 |
| 5800000000.0 |  |  | 313944420033280 | 289759260980622 |
| 5810000000.0 |  |  | 313902793830656 | 289759260980622 |
| 5820000000.0 |  |  | 313861310670848 | 289759260980622 |
| 5830000000.0 |  |  | 313819969817344 | 289759260980622 |
| 5840000000.0 |  |  | 313778770539264 | 289759260980622 |
| 5850000000.0 |  |  | 313737712110592 | 289759260980622 |
| 5860000000.0 |  |  | 313696793809920 | 289759260980622 |
| 5870000000.0 |  |  | 313656014921472 | 289759260980622 |
| 5880000000.0 |  |  | 313615374733568 | 289759260980622 |
| 5890000000.0 |  |  | 313574872540672 | 289759260980622 |
| 5900000000.0 |  |  | 313534507640576 | 289759260980622 |
| 5910000000.0 |  |  | 313494279335936 | 289759260980622 |
| 5920000000.0 |  |  | 313454186935552 | 289759260980622 |
| 5930000000.0 |  |  | 313414229750784 | 289759260980622 |
| 5940000000.0 |  |  | 313374407099648 | 289759260980622 |
| 5950000000.0 |  |  | 313334718303232 | 289759260980622 |
| 5960000000.0 |  |  | 313295162688512 | 289759260980622 |
| 5970000000.0 |  |  | 313255739585536 | 289759260980622 |
| 5980000000.0 |  |  | 313216448330240 | 289759260980622 |
| 5990000000.0 |  |  | 313177288260864 | 289759260980622 |
| 6000000000.0 |  |  | 313138258723072 | 289759260980622 |
| 6010000000.0 |  |  | 313099359065088 | 289759260980622 |
| 6020000000.0 |  |  | 313060588638976 | 289759260980622 |
| 6030000000.0 |  |  | 313021946802176 | 289759260980622 |
| 6040000000.0 |  |  | 312983432916224 | 289759260980622 |
| 6050000000.0 |  |  | 312945046345984 | 289759260980622 |
| 6060000000.0 |  |  | 312906786462208 | 289759260980622 |
| 6070000000.0 |  |  | 312868652637696 | 289759260980622 |
| 6080000000.0 |  |  | 312830644251392 | 289759260980622 |
| 6090000000.0 |  |  | 312792760685312 | 289759260980622 |
| 6100000000.0 |  |  | 312755001324800 | 289759260980622 |
| 6110000000.0 |  |  | 312717365560576 | 289759260980622 |
| 6120000000.0 |  |  | 312679852786688 | 289759260980622 |
| 6130000000.0 |  |  | 312642462401536 | 289759260980622 |
| 6140000000.0 |  |  | 312605193806592 | 289759260980622 |
| 6150000000.0 |  |  | 312568046408448 | 289759260980622 |
| 6160000000.0 |  |  | 312531019616512 | 289759260980622 |
| 6170000000.0 |  |  | 312494112843776 | 289759260980622 |
| 6180000000.0 |  |  | 312457325508608 | 289759260980622 |
| 6190000000.0 |  |  | 312420657031936 | 289759260980622 |
| 6200000000.0 |  |  | 312384106838784 | 289759260980622 |
| 6210000000.0 |  |  | 312347674356992 | 289759260980622 |
| 6220000000.0 |  |  | 312311359019520 | 289759260980622 |
| 6230000000.0 |  |  | 312275160261632 | 289759260980622 |
| 6240000000.0 |  |  | 312239077523712 | 289759260980622 |
| 6250000000.0 |  |  | 312203110248192 | 289759260980622 |
| 6260000000.0 |  |  | 312167257882624 | 289759260980622 |
| 6270000000.0 |  |  | 312131519876096 | 289759260980622 |
| 6280000000.0 |  |  | 312095895683328 | 289759260980622 |
| 6290000000.0 |  |  | 312060384760320 | 289759260980622 |
| 6300000000.0 |  |  | 312024986568704 | 289759260980622 |
| 6310000000.0 |  |  | 311989700572416 | 289759260980622 |
| 6320000000.0 |  |  | 311954526238720 | 289759260980622 |
| 6330000000.0 |  |  | 311919463038208 | 289759260980622 |
| 6340000000.0 |  |  | 311884510445312 | 289759260980622 |
| 6350000000.0 |  |  | 311849667937280 | 289759260980622 |
| 6360000000.0 |  |  | 311814934995200 | 289759260980622 |
| 6370000000.0 |  |  | 311780311102720 | 289759260980622 |
| 6380000000.0 |  |  | 311745795747328 | 289759260980622 |
| 6390000000.0 |  |  | 311711388419328 | 289759260980622 |
| 6400000000.0 |  |  | 311677088612352 | 289759260980622 |
| 6410000000.0 |  |  | 311642895822848 | 289759260980622 |
| 6420000000.0 |  |  | 311608809551872 | 289759260980622 |
| 6430000000.0 |  |  | 311574829301248 | 289759260980622 |
| 6440000000.0 |  |  | 311540954577408 | 289759260980622 |
| 6450000000.0 |  |  | 311507184890368 | 289759260980622 |
| 6460000000.0 |  |  | 311473519750912 | 289759260980622 |
| 6470000000.0 |  |  | 311439958675456 | 289759260980622 |
| 6480000000.0 |  |  | 311406501181696 | 289759260980622 |
| 6490000000.0 |  |  | 311373146790912 | 289759260980622 |
| 6500000000.0 |  |  | 311339895027712 | 289759260980622 |
| 6510000000.0 |  |  | 311306745418496 | 289759260980622 |
| 6520000000.0 |  |  | 311273697493504 | 289759260980622 |
| 6530000000.0 |  |  | 311240750785280 | 289759260980622 |
| 6540000000.0 |  |  | 311207904830464 | 289759260980622 |
| 6550000000.0 |  |  | 311175159166720 | 289759260980622 |
| 6560000000.0 |  |  | 311142513335808 | 289759260980622 |
| 6570000000.0 |  |  | 311109966881536 | 289759260980622 |
| 6580000000.0 |  |  | 311077519351040 | 289759260980622 |
| 6590000000.0 |  |  | 311045170294016 | 289759260980622 |
| 6600000000.0 |  |  | 311012919263232 | 289759260980622 |
| 6610000000.0 |  |  | 310980765812992 | 289759260980622 |
| 6620000000.0 |  |  | 310948709501696 | 289759260980622 |
| 6630000000.0 |  |  | 310916749889536 | 289759260980622 |
| 6640000000.0 |  |  | 310884886540032 | 289759260980622 |
| 6650000000.0 |  |  | 310853119018240 | 289759260980622 |
| 6660000000.0 |  |  | 310821446893056 | 289759260980622 |
| 6670000000.0 |  |  | 310789869735424 | 289759260980622 |
| 6680000000.0 |  |  | 310758387118336 | 289759260980622 |
| 6690000000.0 |  |  | 310726998618624 | 289759260980622 |
| 6700000000.0 |  |  | 310695703814144 | 289759260980622 |
| 6710000000.0 |  |  | 310664502286336 | 289759260980622 |
| 6720000000.0 |  |  | 310633393619200 | 289759260980622 |
| 6730000000.0 |  |  | 310602377397760 | 289759260980622 |
| 6740000000.0 |  |  | 310571453211392 | 289759260980622 |
| 6750000000.0 |  |  | 310540620651008 | 289759260980622 |
| 6760000000.0 |  |  | 310509879309824 | 289759260980622 |
| 6770000000.0 |  |  | 310479228783360 | 289759260980622 |
| 6780000000.0 |  |  | 310448668670208 | 289759260980622 |
| 6790000000.0 |  |  | 310418198570752 | 289759260980622 |
| 6800000000.0 |  |  | 310387818087936 | 289759260980622 |
| 6810000000.0 |  |  | 310357526826752 | 289759260980622 |
| 6820000000.0 |  |  | 310327324395008 | 289759260980622 |
| 6830000000.0 |  |  | 310297210402048 | 289759260980622 |
| 6840000000.0 |  |  | 310267184460800 | 289759260980622 |
| 6850000000.0 |  |  | 310237246184960 | 289759260980622 |
| 6860000000.0 |  |  | 310207395191808 | 289759260980622 |
| 6870000000.0 |  |  | 310177631099648 | 289759260980622 |
| 6880000000.0 |  |  | 310147953529600 | 289759260980622 |
| 6890000000.0 |  |  | 310118362105088 | 289759260980622 |
| 6900000000.0 |  |  | 310088856451584 | 289759260980622 |
| 6910000000.0 |  |  | 310059436196864 | 289759260980622 |
| 6920000000.0 |  |  | 310030100970496 | 289759260980622 |
| 6930000000.0 |  |  | 310000850404352 | 289759260980622 |
| 6940000000.0 |  |  | 309971684132608 | 289759260980622 |
| 6950000000.0 |  |  | 309942601790976 | 289759260980622 |
| 6960000000.0 |  |  | 309913603018752 | 289759260980622 |
| 6970000000.0 |  |  | 309884687454976 | 289759260980622 |
| 6980000000.0 |  |  | 309855854742784 | 289759260980622 |
| 6990000000.0 |  |  | 309827104526592 | 289759260980622 |
| 7000000000.0 |  |  | 309798436452864 | 289759260980622 |
| 7010000000.0 |  |  | 309769850169344 | 289759260980622 |
| 7020000000.0 |  |  | 309741345327104 | 289759260980622 |
| 7030000000.0 |  |  | 309712921579008 | 289759260980622 |
| 7040000000.0 |  |  | 309684578578944 | 289759260980622 |
| 7050000000.0 |  |  | 309656315983360 | 289759260980622 |
| 7060000000.0 |  |  | 309628133450496 | 289759260980622 |
| 7070000000.0 |  |  | 309600030641152 | 289759260980622 |
| 7080000000.0 |  |  | 309572007216640 | 289759260980622 |
| 7090000000.0 |  |  | 309544062841856 | 289759260980622 |
| 7100000000.0 |  |  | 309516197182976 | 289759260980622 |
| 7110000000.0 |  |  | 309488409906944 | 289759260980622 |
| 7120000000.0 |  |  | 309460700684032 | 289759260980622 |
| 7130000000.0 |  |  | 309433069185792 | 289759260980622 |
| 7140000000.0 |  |  | 309405515085312 | 289759260980622 |
| 7150000000.0 |  |  | 309378038058752 | 289759260980622 |
| 7160000000.0 |  |  | 309350637782272 | 289759260980622 |
| 7170000000.0 |  |  | 309323313935104 | 289759260980622 |
| 7180000000.0 |  |  | 309296066198016 | 289759260980622 |
| 7190000000.0 |  |  | 309268894253568 | 289759260980622 |
| 7200000000.0 |  |  | 309241797785088 | 289759260980622 |
| 7210000000.0 |  |  | 309214776479488 | 289759260980622 |
| 7220000000.0 |  |  | 309187830024192 | 289759260980622 |
| 7230000000.0 |  |  | 309160958108672 | 289759260980622 |
| 7240000000.0 |  |  | 309134160423936 | 289759260980622 |
| 7250000000.0 |  |  | 309107436663040 | 289759260980622 |
| 7260000000.0 |  |  | 309080786519552 | 289759260980622 |
| 7270000000.0 |  |  | 309054209691136 | 289759260980622 |
| 7280000000.0 |  |  | 309027705874688 | 289759260980622 |
| 7290000000.0 |  |  | 309001274770432 | 289759260980622 |
| 7300000000.0 |  |  | 308974916079104 | 289759260980622 |
| 7310000000.0 |  |  | 308948629503488 | 289759260980622 |
| 7320000000.0 |  |  | 308922414748160 | 289759260980622 |
| 7330000000.0 |  |  | 308896271519232 | 289759260980622 |
| 7340000000.0 |  |  | 308870199524352 | 289759260980622 |
| 7350000000.0 |  |  | 308844198472704 | 289759260980622 |
| 7360000000.0 |  |  | 308818268075520 | 289759260980622 |
| 7370000000.0 |  |  | 308792408044544 | 289759260980622 |
| 7380000000.0 |  |  | 308766618093824 | 289759260980622 |
| 7390000000.0 |  |  | 308740897939200 | 289759260980622 |
| 7400000000.0 |  |  | 308715247298048 | 289759260980622 |
| 7410000000.0 |  |  | 308689665888256 | 289759260980622 |
| 7420000000.0 |  |  | 308664153430272 | 289759260980622 |
| 7430000000.0 |  |  | 308638709645568 | 289759260980622 |
| 7440000000.0 |  |  | 308613334256896 | 289759260980622 |
| 7450000000.0 |  |  | 308588026989568 | 289759260980622 |
| 7460000000.0 |  |  | 308562787569152 | 289759260980622 |
| 7470000000.0 |  |  | 308537615723520 | 289759260980622 |
| 7480000000.0 |  |  | 308512511181312 | 289759260980622 |
| 7490000000.0 |  |  | 308487473672960 | 289759260980622 |
| 7500000000.0 |  |  | 308462502930432 | 289759260980622 |
| 7510000000.0 |  |  | 308437598686976 | 289759260980622 |
| 7520000000.0 |  |  | 308412760677888 | 289759260980622 |
| 7530000000.0 |  |  | 308387988638464 | 289759260980622 |
| 7540000000.0 |  |  | 308363282306560 | 289759260980622 |
| 7550000000.0 |  |  | 308338641421312 | 289759260980622 |
| 7560000000.0 |  |  | 308314065722368 | 289759260980622 |
| 7570000000.0 |  |  | 308289554951936 | 289759260980622 |
| 7580000000.0 |  |  | 308265108853248 | 289759260980622 |
| 7590000000.0 |  |  | 308240727170304 | 289759260980622 |
| 7600000000.0 |  |  | 308216409648640 | 289759260980622 |
| 7610000000.0 |  |  | 308192156035584 | 289759260980622 |
| 7620000000.0 |  |  | 308167966079488 | 289759260980622 |
| 7630000000.0 |  |  | 308143839530496 | 289759260980622 |
| 7640000000.0 |  |  | 308119776139008 | 289759260980622 |
| 7650000000.0 |  |  | 308095775657728 | 289759260980622 |
| 7660000000.0 |  |  | 308071837839872 | 289759260980622 |
| 7670000000.0 |  |  | 308047962440960 | 289759260980622 |
| 7680000000.0 |  |  | 308024149216256 | 289759260980622 |
| 7690000000.0 |  |  | 308000397924096 | 289759260980622 |
| 7700000000.0 |  |  | 307976708322816 | 289759260980622 |
| 7710000000.0 |  |  | 307953080172544 | 289759260980622 |
| 7720000000.0 |  |  | 307929513234944 | 289759260980622 |
| 7730000000.0 |  |  | 307906007270912 | 289759260980622 |
| 7740000000.0 |  |  | 307882562045440 | 289759260980622 |
| 7750000000.0 |  |  | 307859177323008 | 289759260980622 |
| 7760000000.0 |  |  | 307835852869632 | 289759260980622 |
| 7770000000.0 |  |  | 307812588453888 | 289759260980622 |
| 7780000000.0 |  |  | 307789383841792 | 289759260980622 |
| 7790000000.0 |  |  | 307766238804480 | 289759260980622 |
| 7800000000.0 |  |  | 307743153113600 | 289759260980622 |
| 7810000000.0 |  |  | 307720126540288 | 289759260980622 |
| 7820000000.0 |  |  | 307697158856704 | 289759260980622 |
| 7830000000.0 |  |  | 307674249839104 | 289759260980622 |
| 7840000000.0 |  |  | 307651399262208 | 289759260980622 |
| 7850000000.0 |  |  | 307628606902784 | 289759260980622 |
| 7860000000.0 |  |  | 307605872538112 | 289759260980622 |
| 7870000000.0 |  |  | 307583195947520 | 289759260980622 |
| 7880000000.0 |  |  | 307560576911360 | 289759260980622 |
| 7890000000.0 |  |  | 307538015210496 | 289759260980622 |
| 7900000000.0 |  |  | 307515510626816 | 289759260980622 |
| 7910000000.0 |  |  | 307493062944256 | 289759260980622 |
| 7920000000.0 |  |  | 307470671947264 | 289759260980622 |
| 7930000000.0 |  |  | 307448337421312 | 289759260980622 |
| 7940000000.0 |  |  | 307426059153408 | 289759260980622 |
| 7950000000.0 |  |  | 307403836930048 | 289759260980622 |
| 7960000000.0 |  |  | 307381670541312 | 289759260980622 |
| 7970000000.0 |  |  | 307359559776768 | 289759260980622 |
| 7980000000.0 |  |  | 307337504426496 | 289759260980622 |
| 7990000000.0 |  |  | 307315504282624 | 289759260980622 |
| 8000000000.0 |  |  | 307293559139328 | 289759260980622 |
| 8010000000.0 |  |  | 307271668789248 | 289759260980622 |
| 8020000000.0 |  |  | 307249833028608 | 289759260980622 |
| 8030000000.0 |  |  | 307228051652096 | 289759260980622 |
| 8040000000.0 |  |  | 307206324457984 | 289759260980622 |
| 8050000000.0 |  |  | 307184651244032 | 289759260980622 |
| 8060000000.0 |  |  | 307163031808512 | 289759260980622 |
| 8070000000.0 |  |  | 307141465952256 | 289759260980622 |
| 8080000000.0 |  |  | 307119953477120 | 289759260980622 |
| 8090000000.0 |  |  | 307098494184448 | 289759260980622 |
| 8100000000.0 |  |  | 307077087876096 | 289759260980622 |
| 8110000000.0 |  |  | 307055734357504 | 289759260980622 |
| 8120000000.0 |  |  | 307034433433088 | 289759260980622 |
| 8130000000.0 |  |  | 307013184908800 | 289759260980622 |
| 8140000000.0 |  |  | 306991988591616 | 289759260980622 |
| 8150000000.0 |  |  | 306970844289536 | 289759260980622 |
| 8160000000.0 |  |  | 306949751811584 | 289759260980622 |
| 8170000000.0 |  |  | 306928710966784 | 289759260980622 |
| 8180000000.0 |  |  | 306907721566208 | 289759260980622 |
| 8190000000.0 |  |  | 306886783420416 | 289759260980622 |
| 8200000000.0 |  |  | 306865896344064 | 289759260980622 |
| 8210000000.0 |  |  | 306845060148224 | 289759260980622 |
| 8220000000.0 |  |  | 306824274648576 | 289759260980622 |
| 8230000000.0 |  |  | 306803539659776 | 289759260980622 |
| 8240000000.0 |  |  | 306782854998528 | 289759260980622 |
| 8250000000.0 |  |  | 306762220481024 | 289759260980622 |
| 8260000000.0 |  |  | 306741635924992 | 289759260980622 |
| 8270000000.0 |  |  | 306721101149696 | 289759260980622 |
| 8280000000.0 |  |  | 306700615976448 | 289759260980622 |
| 8290000000.0 |  |  | 306680180223488 | 289759260980622 |
| 8300000000.0 |  |  | 306659793711616 | 289759260980622 |
| 8310000000.0 |  |  | 306639456264704 | 289759260980622 |
| 8320000000.0 |  |  | 306619167706112 | 289759260980622 |
| 8330000000.0 |  |  | 306598927858688 | 289759260980622 |
| 8340000000.0 |  |  | 306578736547328 | 289759260980622 |
| 8350000000.0 |  |  | 306558593597952 | 289759260980622 |
| 8360000000.0 |  |  | 306538498837504 | 289759260980622 |
| 8370000000.0 |  |  | 306518452092416 | 289759260980622 |
| 8380000000.0 |  |  | 306498453190144 | 289759260980622 |
| 8390000000.0 |  |  | 306478501961728 | 289759260980622 |
| 8400000000.0 |  |  | 306458598235648 | 289759260980622 |
| 8410000000.0 |  |  | 306438741842432 | 289759260980622 |
| 8420000000.0 |  |  | 306418932613632 | 289759260980622 |
| 8430000000.0 |  |  | 306399170380800 | 289759260980622 |
| 8440000000.0 |  |  | 306379454978560 | 289759260980622 |
| 8450000000.0 |  |  | 306359786238976 | 289759260980622 |
| 8460000000.0 |  |  | 306340163996672 | 289759260980622 |
| 8470000000.0 |  |  | 306320588087296 | 289759260980622 |
| 8480000000.0 |  |  | 306301058348032 | 289759260980622 |
| 8490000000.0 |  |  | 306281574614016 | 289759260980622 |
| 8500000000.0 |  |  | 306262136723968 | 289759260980622 |
| 8510000000.0 |  |  | 306242744516096 | 289759260980622 |
| 8520000000.0 |  |  | 306223397829120 | 289759260980622 |
| 8530000000.0 |  |  | 306204096503808 | 289759260980622 |
| 8540000000.0 |  |  | 306184840379392 | 289759260980622 |
| 8550000000.0 |  |  | 306165629298176 | 289759260980622 |
| 8560000000.0 |  |  | 306146463102976 | 289759260980622 |
| 8570000000.0 |  |  | 306127341635584 | 289759260980622 |
| 8580000000.0 |  |  | 306108264739328 | 289759260980622 |
| 8590000000.0 |  |  | 306089232260096 | 289759260980622 |
| 8600000000.0 |  |  | 306070244041216 | 289759260980622 |
| 8610000000.0 |  |  | 306051299929600 | 289759260980622 |
| 8620000000.0 |  |  | 306032399771136 | 289759260980622 |
| 8630000000.0 |  |  | 306013543413760 | 289759260980622 |
| 8640000000.0 |  |  | 305994730704896 | 289759260980622 |
| 8650000000.0 |  |  | 305975961493504 | 289759260980622 |
| 8660000000.0 |  |  | 305957235628544 | 289759260980622 |
| 8670000000.0 |  |  | 305938552959488 | 289759260980622 |
| 8680000000.0 |  |  | 305919913338368 | 289759260980622 |
| 8690000000.0 |  |  | 305901316615680 | 289759260980622 |
| 8700000000.0 |  |  | 305882762643456 | 289759260980622 |
| 8710000000.0 |  |  | 305864251274240 | 289759260980622 |
| 8720000000.0 |  |  | 305845782363136 | 289759260980622 |
| 8730000000.0 |  |  | 305827355762176 | 289759260980622 |
| 8740000000.0 |  |  | 305808971326464 | 289759260980622 |
| 8750000000.0 |  |  | 305790628912128 | 289759260980622 |
| 8760000000.0 |  |  | 305772328375808 | 289759260980622 |
| 8770000000.0 |  |  | 305754069573120 | 289759260980622 |
| 8780000000.0 |  |  | 305735852361728 | 289759260980622 |
| 8790000000.0 |  |  | 305717676600320 | 289759260980622 |
| 8800000000.0 |  |  | 305699542147072 | 289759260980622 |
| 8810000000.0 |  |  | 305681448861184 | 289759260980622 |
| 8820000000.0 |  |  | 305663396602368 | 289759260980622 |
| 8830000000.0 |  |  | 305645385231872 | 289759260980622 |
| 8840000000.0 |  |  | 305627414610432 | 289759260980622 |
| 8850000000.0 |  |  | 305609484600832 | 289759260980622 |
| 8860000000.0 |  |  | 305591595064320 | 289759260980622 |
| 8870000000.0 |  |  | 305573745864192 | 289759260980622 |
| 8880000000.0 |  |  | 305555936866304 | 289759260980622 |
| 8890000000.0 |  |  | 305538167932416 | 289759260980622 |
| 8900000000.0 |  |  | 305520438927872 | 289759260980622 |
| 8910000000.0 |  |  | 305502749719040 | 289759260980622 |
| 8920000000.0 |  |  | 305485100172288 | 289759260980622 |
| 8930000000.0 |  |  | 305467490153472 | 289759260980622 |
| 8940000000.0 |  |  | 305449919529984 | 289759260980622 |
| 8950000000.0 |  |  | 305432388170240 | 289759260980622 |
| 8960000000.0 |  |  | 305414895943168 | 289759260980622 |
| 8970000000.0 |  |  | 305397442717184 | 289759260980622 |
| 8980000000.0 |  |  | 305380028361216 | 289759260980622 |
| 8990000000.0 |  |  | 305362652747264 | 289759260980622 |
| 9000000000.0 |  |  | 305345315745792 | 289759260980622 |
| 9010000000.0 |  |  | 305328017227776 | 289759260980622 |
| 9020000000.0 |  |  | 305310757065216 | 289759260980622 |
| 9030000000.0 |  |  | 305293535130112 | 289759260980622 |
| 9040000000.0 |  |  | 305276351297536 | 289759260980622 |
| 9050000000.0 |  |  | 305259205439488 | 289759260980622 |
| 9060000000.0 |  |  | 305242097430528 | 289759260980622 |
| 9070000000.0 |  |  | 305225027145216 | 289759260980622 |
| 9080000000.0 |  |  | 305207994460160 | 289759260980622 |
| 9090000000.0 |  |  | 305190999250432 | 289759260980622 |
| 9100000000.0 |  |  | 305174041391616 | 289759260980622 |
| 9110000000.0 |  |  | 305157120761856 | 289759260980622 |
| 9120000000.0 |  |  | 305140237239296 | 289759260980622 |
| 9130000000.0 |  |  | 305123390700544 | 289759260980622 |
| 9140000000.0 |  |  | 305106581024768 | 289759260980622 |
| 9150000000.0 |  |  | 305089808091136 | 289759260980622 |
| 9160000000.0 |  |  | 305073071779328 | 289759260980622 |
| 9170000000.0 |  |  | 305056371970048 | 289759260980622 |
| 9180000000.0 |  |  | 305039708542976 | 289759260980622 |
| 9190000000.0 |  |  | 305023081379840 | 289759260980622 |
| 9200000000.0 |  |  | 305006490362368 | 289759260980622 |
| 9210000000.0 |  |  | 304989935373312 | 289759260980622 |
| 9220000000.0 |  |  | 304973416293888 | 289759260980622 |
| 9230000000.0 |  |  | 304956933009408 | 289759260980622 |
| 9240000000.0 |  |  | 304940485402624 | 289759260980622 |
| 9250000000.0 |  |  | 304924073357824 | 289759260980622 |
| 9260000000.0 |  |  | 304907696760320 | 289759260980622 |
| 9270000000.0 |  |  | 304891355494400 | 289759260980622 |
| 9280000000.0 |  |  | 304875049446912 | 289759260980622 |
| 9290000000.0 |  |  | 304858778503680 | 289759260980622 |
| 9300000000.0 |  |  | 304842542551040 | 289759260980622 |
| 9310000000.0 |  |  | 304826341476864 | 289759260980622 |
| 9320000000.0 |  |  | 304810175169024 | 289759260980622 |
| 9330000000.0 |  |  | 304794043514880 | 289759260980622 |
| 9340000000.0 |  |  | 304777946403328 | 289759260980622 |
| 9350000000.0 |  |  | 304761883723776 | 289759260980622 |
| 9360000000.0 |  |  | 304745855366656 | 289759260980622 |
| 9370000000.0 |  |  | 304729861220864 | 289759260980622 |
| 9380000000.0 |  |  | 304713901177856 | 289759260980622 |
| 9390000000.0 |  |  | 304697975127552 | 289759260980622 |
| 9400000000.0 |  |  | 304682082962944 | 289759260980622 |
| 9410000000.0 |  |  | 304666224574976 | 289759260980622 |
| 9420000000.0 |  |  | 304650399856640 | 289759260980622 |
| 9430000000.0 |  |  | 304634608699904 | 289759260980622 |
| 9440000000.0 |  |  | 304618850999296 | 289759260980622 |
| 9450000000.0 |  |  | 304603126647808 | 289759260980622 |
| 9460000000.0 |  |  | 304587435539456 | 289759260980622 |
| 9470000000.0 |  |  | 304571777570304 | 289759260980622 |
| 9480000000.0 |  |  | 304556152633856 | 289759260980622 |
| 9490000000.0 |  |  | 304540560627712 | 289759260980622 |
| 9500000000.0 |  |  | 304525001445376 | 289759260980622 |
| 9510000000.0 |  |  | 304509474983936 | 289759260980622 |
| 9520000000.0 |  |  | 304493981142016 | 289759260980622 |
| 9530000000.0 |  |  | 304478519815680 | 289759260980622 |
| 9540000000.0 |  |  | 304463090902528 | 289759260980622 |
| 9550000000.0 |  |  | 304447694300672 | 289759260980622 |
| 9560000000.0 |  |  | 304432329910272 | 289759260980622 |
| 9570000000.0 |  |  | 304416997627904 | 289759260980622 |
| 9580000000.0 |  |  | 304401697354240 | 289759260980622 |
| 9590000000.0 |  |  | 304386428988928 | 289759260980622 |
| 9600000000.0 |  |  | 304371192433664 | 289759260980622 |
| 9610000000.0 |  |  | 304355987587584 | 289759260980622 |
| 9620000000.0 |  |  | 304340814351360 | 289759260980622 |
| 9630000000.0 |  |  | 304325672627712 | 289759260980622 |
| 9640000000.0 |  |  | 304310562318336 | 289759260980622 |
| 9650000000.0 |  |  | 304295483325440 | 289759260980622 |
| 9660000000.0 |  |  | 304280435551744 | 289759260980622 |
| 9670000000.0 |  |  | 304265418900480 | 289759260980622 |
| 9680000000.0 |  |  | 304250433275392 | 289759260980622 |
| 9690000000.0 |  |  | 304235478579712 | 289759260980622 |
| 9700000000.0 |  |  | 304220554717696 | 289759260980622 |
| 9710000000.0 |  |  | 304205661595136 | 289759260980622 |
| 9720000000.0 |  |  | 304190799116800 | 289759260980622 |
| 9730000000.0 |  |  | 304175967187968 | 289759260980622 |
| 9740000000.0 |  |  | 304161165714944 | 289759260980622 |
| 9750000000.0 |  |  | 304146394603008 | 289759260980622 |
| 9760000000.0 |  |  | 304131653760000 | 289759260980622 |
| 9770000000.0 |  |  | 304116943092736 | 289759260980622 |
| 9780000000.0 |  |  | 304102262508032 | 289759260980622 |
| 9790000000.0 |  |  | 304087611913728 | 289759260980622 |
| 9800000000.0 |  |  | 304072991218688 | 289759260980622 |
| 9810000000.0 |  |  | 304058400331776 | 289759260980622 |
| 9820000000.0 |  |  | 304043839160320 | 289759260980622 |
| 9830000000.0 |  |  | 304029307614208 | 289759260980622 |
| 9840000000.0 |  |  | 304014805604864 | 289759260980622 |
| 9850000000.0 |  |  | 304000333041152 | 289759260980622 |
| 9860000000.0 |  |  | 303985889832448 | 289759260980622 |
| 9870000000.0 |  |  | 303971475890688 | 289759260980622 |
| 9880000000.0 |  |  | 303957091126784 | 289759260980622 |
| 9890000000.0 |  |  | 303942735452672 | 289759260980622 |
| 9900000000.0 |  |  | 303928408778752 | 289759260980622 |
| 9910000000.0 |  |  | 303914111018496 | 289759260980622 |
| 9920000000.0 |  |  | 303899842084864 | 289759260980622 |
| 9930000000.0 |  |  | 303885601889792 | 289759260980622 |
| 9940000000.0 |  |  | 303871390345728 | 289759260980622 |
| 9950000000.0 |  |  | 303857207368192 | 289759260980622 |
| 9960000000.0 |  |  | 303843052870656 | 289759260980622 |
| 9970000000.0 |  |  | 303828926767104 | 289759260980622 |
| 9980000000.0 |  |  | 303814828971520 | 289759260980622 |
| 9990000000.0 |  |  | 303800759399936 | 289759260980622 |
| 10000000000.0 |  |  | 303786717966848 | 289759260980622 |
| 10010000000.0 |  |  | 303772704589312 | 289759260980622 |
| 10020000000.0 |  |  | 303758719181824 | 289759260980622 |
| 10030000000.0 |  |  | 303744761660928 | 289759260980622 |
| 10040000000.0 |  |  | 303730831944704 | 289759260980622 |
| 10050000000.0 |  |  | 303716929948672 | 289759260980622 |
| 10060000000.0 |  |  | 303703055589376 | 289759260980622 |
| 10070000000.0 |  |  | 303689208786432 | 289759260980622 |
| 10080000000.0 |  |  | 303675389457920 | 289759260980622 |
| 10090000000.0 |  |  | 303661597521408 | 289759260980622 |
| 10100000000.0 |  |  | 303647832894976 | 289759260980622 |
| 10110000000.0 |  |  | 303634095497216 | 289759260980622 |
| 10120000000.0 |  |  | 303620385249792 | 289759260980622 |
| 10130000000.0 |  |  | 303606702070272 | 289759260980622 |
| 10140000000.0 |  |  | 303593045878784 | 289759260980622 |
| 10150000000.0 |  |  | 303579416595456 | 289759260980622 |
| 10160000000.0 |  |  | 303565814141952 | 289759260980622 |
| 10170000000.0 |  |  | 303552238438912 | 289759260980622 |
| 10180000000.0 |  |  | 303538689405440 | 289759260980622 |
| 10190000000.0 |  |  | 303525166965248 | 289759260980622 |
| 10200000000.0 |  |  | 303511671040000 | 289759260980622 |
| 10210000000.0 |  |  | 303498201551360 | 289759260980622 |
| 10220000000.0 |  |  | 303484758420992 | 289759260980622 |
| 10230000000.0 |  |  | 303471341572096 | 289759260980622 |
| 10240000000.0 |  |  | 303457950928896 | 289759260980622 |
| 10250000000.0 |  |  | 303444586413056 | 289759260980622 |
| 10260000000.0 |  |  | 303431247948288 | 289759260980622 |
| 10270000000.0 |  |  | 303417935458816 | 289759260980622 |
| 10280000000.0 |  |  | 303404648869376 | 289759260980622 |
| 10290000000.0 |  |  | 303391388104704 | 289759260980622 |
| 10300000000.0 |  |  | 303378153087488 | 289759260980622 |
| 10310000000.0 |  |  | 303364943744512 | 289759260980622 |
| 10320000000.0 |  |  | 303351760001536 | 289759260980622 |
| 10330000000.0 |  |  | 303338601783808 | 289759260980622 |
| 10340000000.0 |  |  | 303325469016576 | 289759260980622 |
| 10350000000.0 |  |  | 303312361626112 | 289759260980622 |
| 10360000000.0 |  |  | 303299279540224 | 289759260980622 |
| 10370000000.0 |  |  | 303286222684672 | 289759260980622 |
| 10380000000.0 |  |  | 303273190985728 | 289759260980622 |
| 10390000000.0 |  |  | 303260184372224 | 289759260980622 |
| 10400000000.0 |  |  | 303247202771456 | 289759260980622 |
| 10410000000.0 |  |  | 303234246111232 | 289759260980622 |
| 10420000000.0 |  |  | 303221314318848 | 289759260980622 |
| 10430000000.0 |  |  | 303208407323648 | 289759260980622 |
| 10440000000.0 |  |  | 303195525055488 | 289759260980622 |
| 10450000000.0 |  |  | 303182667441664 | 289759260980622 |
| 10460000000.0 |  |  | 303169834412032 | 289759260980622 |
| 10470000000.0 |  |  | 303157025895936 | 289759260980622 |
| 10480000000.0 |  |  | 303144241823744 | 289759260980622 |
| 10490000000.0 |  |  | 303131482125312 | 289759260980622 |
| 10500000000.0 |  |  | 303118746730496 | 289759260980622 |
| 10510000000.0 |  |  | 303106035570688 | 289759260980622 |
| 10520000000.0 |  |  | 303093348576256 | 289759260980622 |
| 10530000000.0 |  |  | 303080685678592 | 289759260980622 |
| 10540000000.0 |  |  | 303068046809088 | 289759260980622 |
| 10550000000.0 |  |  | 303055431898624 | 289759260980622 |
| 10560000000.0 |  |  | 303042840880640 | 289759260980622 |
| 10570000000.0 |  |  | 303030273686528 | 289759260980622 |
| 10580000000.0 |  |  | 303017730248704 | 289759260980622 |
| 10590000000.0 |  |  | 303005210499584 | 289759260980622 |
| 10600000000.0 |  |  | 302992714373120 | 289759260980622 |
| 10610000000.0 |  |  | 302980241802240 | 289759260980622 |
| 10620000000.0 |  |  | 302967792719360 | 289759260980622 |
| 10630000000.0 |  |  | 302955367058432 | 289759260980622 |
| 10640000000.0 |  |  | 302942964754944 | 289759260980622 |
| 10650000000.0 |  |  | 302930585741312 | 289759260980622 |
| 10660000000.0 |  |  | 302918229952512 | 289759260980622 |
| 10670000000.0 |  |  | 302905897323520 | 289759260980622 |
| 10680000000.0 |  |  | 302893587789824 | 289759260980622 |
| 10690000000.0 |  |  | 302881301285888 | 289759260980622 |
| 10700000000.0 |  |  | 302869037746688 | 289759260980622 |
| 10710000000.0 |  |  | 302856797108736 | 289759260980622 |
| 10720000000.0 |  |  | 302844579308032 | 289759260980622 |
| 10730000000.0 |  |  | 302832384279552 | 289759260980622 |
| 10740000000.0 |  |  | 302820211961344 | 289759260980622 |
| 10750000000.0 |  |  | 302808062288896 | 289759260980622 |
| 10760000000.0 |  |  | 302795935199232 | 289759260980622 |
| 10770000000.0 |  |  | 302783830629376 | 289759260980622 |
| 10780000000.0 |  |  | 302771748516864 | 289759260980622 |
| 10790000000.0 |  |  | 302759688798720 | 289759260980622 |
| 10800000000.0 |  |  | 302747651414016 | 289759260980622 |
| 10810000000.0 |  |  | 302735636300288 | 289759260980622 |
| 10820000000.0 |  |  | 302723643395072 | 289759260980622 |
| 10830000000.0 |  |  | 302711672637440 | 289759260980622 |
| 10840000000.0 |  |  | 302699723965952 | 289759260980622 |
| 10850000000.0 |  |  | 302687797319680 | 289759260980622 |
| 10860000000.0 |  |  | 302675892637184 | 289759260980622 |
| 10870000000.0 |  |  | 302664009858048 | 289759260980622 |
| 10880000000.0 |  |  | 302652148922880 | 289759260980622 |
| 10890000000.0 |  |  | 302640309770240 | 289759260980622 |
| 10900000000.0 |  |  | 302628492340224 | 289759260980622 |
| 10910000000.0 |  |  | 302616696574464 | 289759260980622 |
| 10920000000.0 |  |  | 302604922412544 | 289759260980622 |
| 10930000000.0 |  |  | 302593169795072 | 289759260980622 |
| 10940000000.0 |  |  | 302581438662656 | 289759260980622 |
| 10950000000.0 |  |  | 302569728956416 | 289759260980622 |
| 10960000000.0 |  |  | 302558040619520 | 289759260980622 |
| 10970000000.0 |  |  | 302546373591552 | 289759260980622 |
| 10980000000.0 |  |  | 302534727814656 | 289759260980622 |
| 10990000000.0 |  |  | 302523103230976 | 289759260980622 |
| 11000000000.0 |  |  | 302511499783168 | 289759260980622 |
| 11010000000.0 |  |  | 302499917412864 | 289759260980622 |
| 11020000000.0 |  |  | 302488356062720 | 289759260980622 |
| 11030000000.0 |  |  | 302476815676416 | 289759260980622 |
| 11040000000.0 |  |  | 302465296196608 | 289759260980622 |
| 11050000000.0 |  |  | 302453797566464 | 289759260980622 |
| 11060000000.0 |  |  | 302442319729152 | 289759260980622 |
| 11070000000.0 |  |  | 302430862628352 | 289759260980622 |
| 11080000000.0 |  |  | 302419426208768 | 289759260980622 |
| 11090000000.0 |  |  | 302408010413568 | 289759260980622 |
| 11100000000.0 |  |  | 302396615186944 | 289759260980622 |
| 11110000000.0 |  |  | 302385240473600 | 289759260980622 |
| 11120000000.0 |  |  | 302373886218752 | 289759260980622 |
| 11130000000.0 |  |  | 302362552366592 | 289759260980622 |
| 11140000000.0 |  |  | 302351238861824 | 289759260980622 |
| 11150000000.0 |  |  | 302339945650688 | 289759260980622 |
| 11160000000.0 |  |  | 302328672678400 | 289759260980622 |
| 11170000000.0 |  |  | 302317419889664 | 289759260980622 |
| 11180000000.0 |  |  | 302306187231744 | 289759260980622 |
| 11190000000.0 |  |  | 302294974649344 | 289759260980622 |
| 11200000000.0 |  |  | 302283782090240 | 289759260980622 |
| 11210000000.0 |  |  | 302272609499136 | 289759260980622 |
| 11220000000.0 |  |  | 302261456823296 | 289759260980622 |
| 11230000000.0 |  |  | 302250324009472 | 289759260980622 |
| 11240000000.0 |  |  | 302239211005952 | 289759260980622 |
| 11250000000.0 |  |  | 302228117757952 | 289759260980622 |
| 11260000000.0 |  |  | 302217044213248 | 289759260980622 |
| 11270000000.0 |  |  | 302205990320128 | 289759260980622 |
| 11280000000.0 |  |  | 302194956026880 | 289759260980622 |
| 11290000000.0 |  |  | 302183941280256 | 289759260980622 |
| 11300000000.0 |  |  | 302172946028032 | 289759260980622 |
| 11310000000.0 |  |  | 302161970219008 | 289759260980622 |
| 11320000000.0 |  |  | 302151013802496 | 289759260980622 |
| 11330000000.0 |  |  | 302140076726272 | 289759260980622 |
| 11340000000.0 |  |  | 302129158938624 | 289759260980622 |
| 11350000000.0 |  |  | 302118260389376 | 289759260980622 |
| 11360000000.0 |  |  | 302107381028864 | 289759260980622 |
| 11370000000.0 |  |  | 302096520803840 | 289759260980622 |
| 11380000000.0 |  |  | 302085679665152 | 289759260980622 |
| 11390000000.0 |  |  | 302074857563136 | 289759260980622 |
| 11400000000.0 |  |  | 302064054447104 | 289759260980622 |
| 11410000000.0 |  |  | 302053270267904 | 289759260980622 |
| 11420000000.0 |  |  | 302042504973824 | 289759260980622 |
| 11430000000.0 |  |  | 302031758517248 | 289759260980622 |
| 11440000000.0 |  |  | 302021030848000 | 289759260980622 |
| 11450000000.0 |  |  | 302010321917440 | 289759260980622 |
| 11460000000.0 |  |  | 301999631675392 | 289759260980622 |
| 11470000000.0 |  |  | 301988960073216 | 289759260980622 |
| 11480000000.0 |  |  | 301978307063296 | 289759260980622 |
| 11490000000.0 |  |  | 301967672596480 | 289759260980622 |
| 11500000000.0 |  |  | 301957056623104 | 289759260980622 |
| 11510000000.0 |  |  | 301946459097088 | 289759260980622 |
| 11520000000.0 |  |  | 301935879969792 | 289759260980622 |
| 11530000000.0 |  |  | 301925319193088 | 289759260980622 |
| 11540000000.0 |  |  | 301914776718336 | 289759260980622 |
| 11550000000.0 |  |  | 301904252499456 | 289759260980622 |
| 11560000000.0 |  |  | 301893746487808 | 289759260980622 |
| 11570000000.0 |  |  | 301883258637824 | 289759260980622 |
| 11580000000.0 |  |  | 301872788900352 | 289759260980622 |
| 11590000000.0 |  |  | 301862337230336 | 289759260980622 |
| 11600000000.0 |  |  | 301851903580672 | 289759260980622 |
| 11610000000.0 |  |  | 301841487903744 | 289759260980622 |
| 11620000000.0 |  |  | 301831090153984 | 289759260980622 |
| 11630000000.0 |  |  | 301820710284800 | 289759260980622 |
| 11640000000.0 |  |  | 301810348251136 | 289759260980622 |
| 11650000000.0 |  |  | 301800004005888 | 289759260980622 |
| 11660000000.0 |  |  | 301789677504000 | 289759260980622 |
| 11670000000.0 |  |  | 301779368698368 | 289759260980622 |
| 11680000000.0 |  |  | 301769077545984 | 289759260980622 |
| 11690000000.0 |  |  | 301758804000768 | 289759260980622 |
| 11700000000.0 |  |  | 301748548015616 | 289759260980622 |
| 11710000000.0 |  |  | 301738309547008 | 289759260980622 |
| 11720000000.0 |  |  | 301728088550912 | 289759260980622 |
| 11730000000.0 |  |  | 301717884981760 | 289759260980622 |
| 11740000000.0 |  |  | 301707698794496 | 289759260980622 |
| 11750000000.0 |  |  | 301697529945600 | 289759260980622 |
| 11760000000.0 |  |  | 301687378391040 | 289759260980622 |
| 11770000000.0 |  |  | 301677244086272 | 289759260980622 |
| 11780000000.0 |  |  | 301667126986752 | 289759260980622 |
| 11790000000.0 |  |  | 301657027048960 | 289759260980622 |
| 11800000000.0 |  |  | 301646944230912 | 289759260980622 |
| 11810000000.0 |  |  | 301636878487552 | 289759260980622 |
| 11820000000.0 |  |  | 301626829774848 | 289759260980622 |
| 11830000000.0 |  |  | 301616798051328 | 289759260980622 |
| 11840000000.0 |  |  | 301606783273472 | 289759260980622 |
| 11850000000.0 |  |  | 301596785397248 | 289759260980622 |
| 11860000000.0 |  |  | 301586804381184 | 289759260980622 |
| 11870000000.0 |  |  | 301576840181760 | 289759260980622 |
| 11880000000.0 |  |  | 301566892757504 | 289759260980622 |
| 11890000000.0 |  |  | 301556962066432 | 289759260980622 |
| 11900000000.0 |  |  | 301547048064512 | 289759260980622 |
| 11910000000.0 |  |  | 301537150710272 | 289759260980622 |
| 11920000000.0 |  |  | 301527269963264 | 289759260980622 |
| 11930000000.0 |  |  | 301517405780992 | 289759260980622 |
| 11940000000.0 |  |  | 301507558119936 | 289759260980622 |
| 11950000000.0 |  |  | 301497726941184 | 289759260980622 |
| 11960000000.0 |  |  | 301487912203264 | 289759260980622 |
| 11970000000.0 |  |  | 301478113862656 | 289759260980622 |
| 11980000000.0 |  |  | 301468331880448 | 289759260980622 |
| 11990000000.0 |  |  | 301458566214656 | 289759260980622 |
| 12000000000.0 |  |  | 301448816825344 | 289759260980622 |
| 12010000000.0 |  |  | 301439083672064 | 289759260980622 |
| 12020000000.0 |  |  | 301429366712832 | 289759260980622 |
| 12030000000.0 |  |  | 301419665907712 | 289759260980622 |
| 12040000000.0 |  |  | 301409981217792 | 289759260980622 |
| 12050000000.0 |  |  | 301400312601600 | 289759260980622 |
| 12060000000.0 |  |  | 301390660019200 | 289759260980622 |
| 12070000000.0 |  |  | 301381023431168 | 289759260980622 |
| 12080000000.0 |  |  | 301371402798080 | 289759260980622 |
| 12090000000.0 |  |  | 301361798078976 | 289759260980622 |
| 12100000000.0 |  |  | 301352209235968 | 289759260980622 |
| 12110000000.0 |  |  | 301342636229120 | 289759260980622 |
| 12120000000.0 |  |  | 301333079019520 | 289759260980622 |
| 12130000000.0 |  |  | 301323537567744 | 289759260980622 |
| 12140000000.0 |  |  | 301314011834368 | 289759260980622 |
| 12150000000.0 |  |  | 301304501781504 | 289759260980622 |
| 12160000000.0 |  |  | 301295007370752 | 289759260980622 |
| 12170000000.0 |  |  | 301285528562176 | 289759260980622 |
| 12180000000.0 |  |  | 301276065318400 | 289759260980622 |
| 12190000000.0 |  |  | 301266617600512 | 289759260980622 |
| 12200000000.0 |  |  | 301257185370112 | 289759260980622 |
| 12210000000.0 |  |  | 301247768590336 | 289759260980622 |
| 12220000000.0 |  |  | 301238367222272 | 289759260980622 |
| 12230000000.0 |  |  | 301228981228544 | 289759260980622 |
| 12240000000.0 |  |  | 301219610571264 | 289759260980622 |
| 12250000000.0 |  |  | 301210255213568 | 289759260980622 |
| 12260000000.0 |  |  | 301200915116544 | 289759260980622 |
| 12270000000.0 |  |  | 301191590243840 | 289759260980622 |
| 12280000000.0 |  |  | 301182280558592 | 289759260980622 |
| 12290000000.0 |  |  | 301172986023424 | 289759260980622 |
| 12300000000.0 |  |  | 301163706600448 | 289759260980622 |
| 12310000000.0 |  |  | 301154442253824 | 289759260980622 |
| 12320000000.0 |  |  | 301145192947200 | 289759260980622 |
| 12330000000.0 |  |  | 301135958643200 | 289759260980622 |
| 12340000000.0 |  |  | 301126739304960 | 289759260980622 |
| 12350000000.0 |  |  | 301117534897664 | 289759260980622 |
| 12360000000.0 |  |  | 301108345383424 | 289759260980622 |
| 12370000000.0 |  |  | 301099170727424 | 289759260980622 |
| 12380000000.0 |  |  | 301090010892800 | 289759260980622 |
| 12390000000.0 |  |  | 301080865844224 | 289759260980622 |
| 12400000000.0 |  |  | 301071735545856 | 289759260980622 |
| 12410000000.0 |  |  | 301062619961856 | 289759260980622 |
| 12420000000.0 |  |  | 301053519055872 | 289759260980622 |
| 12430000000.0 |  |  | 301044432793600 | 289759260980622 |
| 12440000000.0 |  |  | 301035361140224 | 289759260980622 |
| 12450000000.0 |  |  | 301026304059392 | 289759260980622 |
| 12460000000.0 |  |  | 301017261514752 | 289759260980622 |
| 12470000000.0 |  |  | 301008233474048 | 289759260980622 |
| 12480000000.0 |  |  | 300999219901440 | 289759260980622 |
| 12490000000.0 |  |  | 300990220762624 | 289759260980622 |
| 12500000000.0 |  |  | 300981236021248 | 289759260980622 |
| 12510000000.0 |  |  | 300972265644544 | 289759260980622 |
| 12520000000.0 |  |  | 300963309597184 | 289759260980622 |
| 12530000000.0 |  |  | 300954367845888 | 289759260980622 |
| 12540000000.0 |  |  | 300945440354304 | 289759260980622 |
| 12550000000.0 |  |  | 300936527090688 | 289759260980622 |
| 12560000000.0 |  |  | 300927628020224 | 289759260980622 |
| 12570000000.0 |  |  | 300918743108608 | 289759260980622 |
| 12580000000.0 |  |  | 300909872321536 | 289759260980622 |
| 12590000000.0 |  |  | 300901015626752 | 289759260980622 |
| 12600000000.0 |  |  | 300892172990464 | 289759260980622 |
| 12610000000.0 |  |  | 300883344379904 | 289759260980622 |
| 12620000000.0 |  |  | 300874529759232 | 289759260980622 |
| 12630000000.0 |  |  | 300865729096704 | 289759260980622 |
| 12640000000.0 |  |  | 300856942360064 | 289759260980622 |
| 12650000000.0 |  |  | 300848169515520 | 289759260980622 |
| 12660000000.0 |  |  | 300839410529280 | 289759260980622 |
| 12670000000.0 |  |  | 300830665369600 | 289759260980622 |
| 12680000000.0 |  |  | 300821934003200 | 289759260980622 |
| 12690000000.0 |  |  | 300813216398336 | 289759260980622 |
| 12700000000.0 |  |  | 300804512521216 | 289759260980622 |
| 12710000000.0 |  |  | 300795822341120 | 289759260980622 |
| 12720000000.0 |  |  | 300787145824256 | 289759260980622 |
| 12730000000.0 |  |  | 300778482939392 | 289759260980622 |
| 12740000000.0 |  |  | 300769833653248 | 289759260980622 |
| 12750000000.0 |  |  | 300761197934592 | 289759260980622 |
| 12760000000.0 |  |  | 300752575752192 | 289759260980622 |
| 12770000000.0 |  |  | 300743967073280 | 289759260980622 |
| 12780000000.0 |  |  | 300735371865600 | 289759260980622 |
| 12790000000.0 |  |  | 300726790098944 | 289759260980622 |
| 12800000000.0 |  |  | 300718221741568 | 289759260980622 |
| 12810000000.0 |  |  | 300709666762240 | 289759260980622 |
| 12820000000.0 |  |  | 300701125127680 | 289759260980622 |
| 12830000000.0 |  |  | 300692596808192 | 289759260980622 |
| 12840000000.0 |  |  | 300684081773568 | 289759260980622 |
| 12850000000.0 |  |  | 300675579992064 | 289759260980622 |
| 12860000000.0 |  |  | 300667091431424 | 289759260980622 |
| 12870000000.0 |  |  | 300658616062976 | 289759260980622 |
| 12880000000.0 |  |  | 300650153854976 | 289759260980622 |
| 12890000000.0 |  |  | 300641704776704 | 289759260980622 |
| 12900000000.0 |  |  | 300633268797440 | 289759260980622 |
| 12910000000.0 |  |  | 300624845886464 | 289759260980622 |
| 12920000000.0 |  |  | 300616436014592 | 289759260980622 |
| 12930000000.0 |  |  | 300608039151616 | 289759260980622 |
| 12940000000.0 |  |  | 300599655265792 | 289759260980622 |
| 12950000000.0 |  |  | 300591284327936 | 289759260980622 |
| 12960000000.0 |  |  | 300582926308864 | 289759260980622 |
| 12970000000.0 |  |  | 300574581177856 | 289759260980622 |
| 12980000000.0 |  |  | 300566248904704 | 289759260980622 |
| 12990000000.0 |  |  | 300557929460224 | 289759260980622 |
| 13000000000.0 |  |  | 300549622815744 | 289759260980622 |
| 13010000000.0 |  |  | 300541328940544 | 289759260980622 |
| 13020000000.0 |  |  | 300533047804416 | 289759260980622 |
| 13030000000.0 |  |  | 300524779380224 | 289759260980622 |
| 13040000000.0 |  |  | 300516523637760 | 289759260980622 |
| 13050000000.0 |  |  | 300508280547328 | 289759260980622 |
| 13060000000.0 |  |  | 300500050079232 | 289759260980622 |
| 13070000000.0 |  |  | 300491832206848 | 289759260980622 |
| 13080000000.0 |  |  | 300483626899968 | 289759260980622 |
| 13090000000.0 |  |  | 300475434129408 | 289759260980622 |
| 13100000000.0 |  |  | 300467253867008 | 289759260980622 |
| 13110000000.0 |  |  | 300459086083584 | 289759260980622 |
| 13120000000.0 |  |  | 300450930751488 | 289759260980622 |
| 13130000000.0 |  |  | 300442787841536 | 289759260980622 |
| 13140000000.0 |  |  | 300434657325568 | 289759260980622 |
| 13150000000.0 |  |  | 300426539174912 | 289759260980622 |
| 13160000000.0 |  |  | 300418433362432 | 289759260980622 |
| 13170000000.0 |  |  | 300410339859968 | 289759260980622 |
| 13180000000.0 |  |  | 300402258637824 | 289759260980622 |
| 13190000000.0 |  |  | 300394189668864 | 289759260980622 |
| 13200000000.0 |  |  | 300386132926976 | 289759260980622 |
| 13210000000.0 |  |  | 300378088382464 | 289759260980622 |
| 13220000000.0 |  |  | 300370056008192 | 289759260980622 |
| 13230000000.0 |  |  | 300362035776000 | 289759260980622 |
| 13240000000.0 |  |  | 300354027659776 | 289759260980622 |
| 13250000000.0 |  |  | 300346031630848 | 289759260980622 |
| 13260000000.0 |  |  | 300338047662080 | 289759260980622 |
| 13270000000.0 |  |  | 300330075726336 | 289759260980622 |
| 13280000000.0 |  |  | 300322115796992 | 289759260980622 |
| 13290000000.0 |  |  | 300314167846400 | 289759260980622 |
| 13300000000.0 |  |  | 300306231846400 | 289759260980622 |
| 13310000000.0 |  |  | 300298307771904 | 289759260980622 |
| 13320000000.0 |  |  | 300290395595264 | 289759260980622 |
| 13330000000.0 |  |  | 300282495290880 | 289759260980622 |
| 13340000000.0 |  |  | 300274606829568 | 289759260980622 |
| 13350000000.0 |  |  | 300266730186240 | 289759260980622 |
| 13360000000.0 |  |  | 300258865335296 | 289759260980622 |
| 13370000000.0 |  |  | 300251012249088 | 289759260980622 |
| 13380000000.0 |  |  | 300243170900480 | 289759260980622 |
| 13390000000.0 |  |  | 300235341264384 | 289759260980622 |
| 13400000000.0 |  |  | 300227523314688 | 289759260980622 |
| 13410000000.0 |  |  | 300219717024768 | 289759260980622 |
| 13420000000.0 |  |  | 300211922368000 | 289759260980622 |
| 13430000000.0 |  |  | 300204139318784 | 289759260980622 |
| 13440000000.0 |  |  | 300196367852544 | 289759260980622 |
| 13450000000.0 |  |  | 300188607942144 | 289759260980622 |
| 13460000000.0 |  |  | 300180859561472 | 289759260980622 |
| 13470000000.0 |  |  | 300173122685440 | 289759260980622 |
| 13480000000.0 |  |  | 300165397288960 | 289759260980622 |
| 13490000000.0 |  |  | 300157683345920 | 289759260980622 |
| 13500000000.0 |  |  | 300149980830720 | 289759260980622 |
| 13510000000.0 |  |  | 300142289717248 | 289759260980622 |
| 13520000000.0 |  |  | 300134609982464 | 289759260980622 |
| 13530000000.0 |  |  | 300126941600256 | 289759260980622 |
| 13540000000.0 |  |  | 300119284542976 | 289759260980622 |
| 13550000000.0 |  |  | 300111638788096 | 289759260980622 |
| 13560000000.0 |  |  | 300104004311552 | 289759260980622 |
| 13570000000.0 |  |  | 300096381085696 | 289759260980622 |
| 13580000000.0 |  |  | 300088769086976 | 289759260980622 |
| 13590000000.0 |  |  | 300081168290816 | 289759260980622 |
| 13600000000.0 |  |  | 300073578672640 | 289759260980622 |
| 13610000000.0 |  |  | 300066000207360 | 289759260980622 |
| 13620000000.0 |  |  | 300058432870400 | 289759260980622 |
| 13630000000.0 |  |  | 300050876636160 | 289759260980622 |
| 13640000000.0 |  |  | 300043331483136 | 289759260980622 |
| 13650000000.0 |  |  | 300035797384704 | 289759260980622 |
| 13660000000.0 |  |  | 300028274315776 | 289759260980622 |
| 13670000000.0 |  |  | 300020762254848 | 289759260980622 |
| 13680000000.0 |  |  | 300013261176320 | 289759260980622 |
| 13690000000.0 |  |  | 300005771056640 | 289759260980622 |
| 13700000000.0 |  |  | 299998291870720 | 289759260980622 |
| 13710000000.0 |  |  | 299990823595008 | 289759260980622 |
| 13720000000.0 |  |  | 299983366206464 | 289759260980622 |
| 13730000000.0 |  |  | 299975919681024 | 289759260980622 |
| 13740000000.0 |  |  | 299968483994112 | 289759260980622 |
| 13750000000.0 |  |  | 299961059123200 | 289759260980622 |
| 13760000000.0 |  |  | 299953645043712 | 289759260980622 |
| 13770000000.0 |  |  | 299946241734144 | 289759260980622 |
| 13780000000.0 |  |  | 299938849167360 | 289759260980622 |
| 13790000000.0 |  |  | 299931467322880 | 289759260980622 |
| 13800000000.0 |  |  | 299924096177152 | 289759260980622 |
| 13810000000.0 |  |  | 299916735706112 | 289759260980622 |
| 13820000000.0 |  |  | 299909385887744 | 289759260980622 |
| 13830000000.0 |  |  | 299902046696960 | 289759260980622 |
| 13840000000.0 |  |  | 299894718112768 | 289759260980622 |
| 13850000000.0 |  |  | 299887400111616 | 289759260980622 |
| 13860000000.0 |  |  | 299880092669440 | 289759260980622 |
| 13870000000.0 |  |  | 299872795764224 | 289759260980622 |
| 13880000000.0 |  |  | 299865509373952 | 289759260980622 |
| 13890000000.0 |  |  | 299858233475584 | 289759260980622 |
| 13900000000.0 |  |  | 299850968044032 | 289759260980622 |
| 13910000000.0 |  |  | 299843713059840 | 289759260980622 |
| 13920000000.0 |  |  | 299836468499968 | 289759260980622 |
| 13930000000.0 |  |  | 299829234341888 | 289759260980622 |
| 13940000000.0 |  |  | 299822010561536 | 289759260980622 |
| 13950000000.0 |  |  | 299814797137920 | 289759260980622 |
| 13960000000.0 |  |  | 299807594049536 | 289759260980622 |
| 13970000000.0 |  |  | 299800401272832 | 289759260980622 |
| 13980000000.0 |  |  | 299793218786304 | 289759260980622 |
| 13990000000.0 |  |  | 299786046567424 | 289759260980622 |
| 14000000000.0 |  |  | 299778884595200 | 289759260980622 |
| 14010000000.0 |  |  | 299771732847104 | 289759260980622 |
| 14020000000.0 |  |  | 299764591299584 | 289759260980622 |
| 14030000000.0 |  |  | 299757459933184 | 289759260980622 |
| 14040000000.0 |  |  | 299750338725888 | 289759260980622 |
| 14050000000.0 |  |  | 299743227655680 | 289759260980622 |
| 14060000000.0 |  |  | 299736126700544 | 289759260980622 |
| 14070000000.0 |  |  | 299729035838464 | 289759260980622 |
| 14080000000.0 |  |  | 299721955049984 | 289759260980622 |
| 14090000000.0 |  |  | 299714884312064 | 289759260980622 |
| 14100000000.0 |  |  | 299707823602176 | 289759260980622 |
| 14110000000.0 |  |  | 299700772900864 | 289759260980622 |
| 14120000000.0 |  |  | 299693732186624 | 289759260980622 |
| 14130000000.0 |  |  | 299686701438464 | 289759260980622 |
| 14140000000.0 |  |  | 299679680633856 | 289759260980622 |
| 14150000000.0 |  |  | 299672669752832 | 289759260980622 |
| 14160000000.0 |  |  | 299665668773888 | 289759260980622 |
| 14170000000.0 |  |  | 299658677677056 | 289759260980622 |
| 14180000000.0 |  |  | 299651696440320 | 289759260980622 |
| 14190000000.0 |  |  | 299644725042688 | 289759260980622 |
| 14200000000.0 |  |  | 299637763464704 | 289759260980622 |
| 14210000000.0 |  |  | 299630811684864 | 289759260980622 |
| 14220000000.0 |  |  | 299623869682176 | 289759260980622 |
| 14230000000.0 |  |  | 299616937436672 | 289759260980622 |
| 14240000000.0 |  |  | 299610014926848 | 289759260980622 |
| 14250000000.0 |  |  | 299603102133248 | 289759260980622 |
| 14260000000.0 |  |  | 299596199034880 | 289759260980622 |
| 14270000000.0 |  |  | 299589305610240 | 289759260980622 |
| 14280000000.0 |  |  | 299582421841408 | 289759260980622 |
| 14290000000.0 |  |  | 299575547707392 | 289759260980622 |
| 14300000000.0 |  |  | 299568683187200 | 289759260980622 |
| 14310000000.0 |  |  | 299561828259840 | 289759260980622 |
| 14320000000.0 |  |  | 299554982907392 | 289759260980622 |
| 14330000000.0 |  |  | 299548147109376 | 289759260980622 |
| 14340000000.0 |  |  | 299541320843776 | 289759260980622 |
| 14350000000.0 |  |  | 299534504093184 | 289759260980622 |
| 14360000000.0 |  |  | 299527696836096 | 289759260980622 |
| 14370000000.0 |  |  | 299520899053568 | 289759260980622 |
| 14380000000.0 |  |  | 299514110725120 | 289759260980622 |
| 14390000000.0 |  |  | 299507331831296 | 289759260980622 |
| 14400000000.0 |  |  | 299500562353152 | 289759260980622 |
| 14410000000.0 |  |  | 299493802270720 | 289759260980622 |
| 14420000000.0 |  |  | 299487051563520 | 289759260980622 |
| 14430000000.0 |  |  | 299480310213120 | 289759260980622 |
| 14440000000.0 |  |  | 299473578199552 | 289759260980622 |
| 14450000000.0 |  |  | 299466855503872 | 289759260980622 |
| 14460000000.0 |  |  | 299460142106624 | 289759260980622 |
| 14470000000.0 |  |  | 299453437988352 | 289759260980622 |
| 14480000000.0 |  |  | 299446743129088 | 289759260980622 |
| 14490000000.0 |  |  | 299440057511936 | 289759260980622 |
| 14500000000.0 |  |  | 299433381114880 | 289759260980622 |
| 14510000000.0 |  |  | 299426713920000 | 289759260980622 |
| 14520000000.0 |  |  | 299420055909888 | 289759260980622 |
| 14530000000.0 |  |  | 299413407064064 | 289759260980622 |
| 14540000000.0 |  |  | 299406767363072 | 289759260980622 |
| 14550000000.0 |  |  | 299400136788992 | 289759260980622 |
| 14560000000.0 |  |  | 299393515322880 | 289759260980622 |
| 14570000000.0 |  |  | 299386902946304 | 289759260980622 |
| 14580000000.0 |  |  | 299380299639808 | 289759260980622 |
| 14590000000.0 |  |  | 299373705384960 | 289759260980622 |
| 14600000000.0 |  |  | 299367120164352 | 289759260980622 |
| 14610000000.0 |  |  | 299360543957504 | 289759260980622 |
| 14620000000.0 |  |  | 299353976746496 | 289759260980622 |
| 14630000000.0 |  |  | 299347418513408 | 289759260980622 |
| 14640000000.0 |  |  | 299340869239808 | 289759260980622 |
| 14650000000.0 |  |  | 299334328907264 | 289759260980622 |
| 14660000000.0 |  |  | 299327797497344 | 289759260980622 |
| 14670000000.0 |  |  | 299321274991104 | 289759260980622 |
| 14680000000.0 |  |  | 299314761372160 | 289759260980622 |
| 14690000000.0 |  |  | 299308256620544 | 289759260980622 |
| 14700000000.0 |  |  | 299301760719872 | 289759260980622 |
| 14710000000.0 |  |  | 299295273650176 | 289759260980622 |
| 14720000000.0 |  |  | 299288795394560 | 289759260980622 |
| 14730000000.0 |  |  | 299282325935616 | 289759260980622 |
| 14740000000.0 |  |  | 299275865253888 | 289759260980622 |
| 14750000000.0 |  |  | 299269413331968 | 289759260980622 |
| 14760000000.0 |  |  | 299262970153472 | 289759260980622 |
| 14770000000.0 |  |  | 299256535699968 | 289759260980622 |
| 14780000000.0 |  |  | 299250109952000 | 289759260980622 |
| 14790000000.0 |  |  | 299243692894208 | 289759260980622 |
| 14800000000.0 |  |  | 299237284508160 | 289759260980622 |
| 14810000000.0 |  |  | 299230884776448 | 289759260980622 |
| 14820000000.0 |  |  | 299224493680128 | 289759260980622 |
| 14830000000.0 |  |  | 299218111203328 | 289759260980622 |
| 14840000000.0 |  |  | 299211737329664 | 289759260980622 |
| 14850000000.0 |  |  | 299205372039168 | 289759260980622 |
| 14860000000.0 |  |  | 299199015315968 | 289759260980622 |
| 14870000000.0 |  |  | 299192667141632 | 289759260980622 |
| 14880000000.0 |  |  | 299186327499776 | 289759260980622 |
| 14890000000.0 |  |  | 299179996374528 | 289759260980622 |
| 14900000000.0 |  |  | 299173673745920 | 289759260980622 |
| 14910000000.0 |  |  | 299167359599616 | 289759260980622 |
| 14920000000.0 |  |  | 299161053916672 | 289759260980622 |
| 14930000000.0 |  |  | 299154756681216 | 289759260980622 |
| 14940000000.0 |  |  | 299148467875328 | 289759260980622 |
| 14950000000.0 |  |  | 299142187482112 | 289759260980622 |
| 14960000000.0 |  |  | 299135915485696 | 289759260980622 |
| 14970000000.0 |  |  | 299129651869184 | 289759260980622 |
| 14980000000.0 |  |  | 299123396614144 | 289759260980622 |
| 14990000000.0 |  |  | 299117149705216 | 289759260980622 |
| 15000000000.0 |  |  | 299110911125504 | 289759260980622 |
| 15010000000.0 |  |  | 299104680858624 | 289759260980622 |
| 15020000000.0 |  |  | 299098458887168 | 289759260980622 |
| 15030000000.0 |  |  | 299092245195264 | 289759260980622 |
| 15040000000.0 |  |  | 299086039767552 | 289759260980622 |
| 15050000000.0 |  |  | 299079842585088 | 289759260980622 |
| 15060000000.0 |  |  | 299073653632512 | 289759260980622 |
| 15070000000.0 |  |  | 299067472893440 | 289759260980622 |
| 15080000000.0 |  |  | 299061300351488 | 289759260980622 |
| 15090000000.0 |  |  | 299055135991296 | 289759260980622 |
| 15100000000.0 |  |  | 299048979795456 | 289759260980622 |
| 15110000000.0 |  |  | 299042831747584 | 289759260980622 |
| 15120000000.0 |  |  | 299036691832832 | 289759260980622 |
| 15130000000.0 |  |  | 299030560033792 | 289759260980622 |
| 15140000000.0 |  |  | 299024436334592 | 289759260980622 |
| 15150000000.0 |  |  | 299018320719360 | 289759260980622 |
| 15160000000.0 |  |  | 299012213172736 | 289759260980622 |
| 15170000000.0 |  |  | 299006113678848 | 289759260980622 |
| 15180000000.0 |  |  | 299000022219776 | 289759260980622 |
| 15190000000.0 |  |  | 298993938781696 | 289759260980622 |
| 15200000000.0 |  |  | 298987863348736 | 289759260980622 |
| 15210000000.0 |  |  | 298981795904000 | 289759260980622 |
| 15220000000.0 |  |  | 298975736431616 | 289759260980622 |
| 15230000000.0 |  |  | 298969684916736 | 289759260980622 |
| 15240000000.0 |  |  | 298963641343488 | 289759260980622 |
| 15250000000.0 |  |  | 298957605696512 | 289759260980622 |
| 15260000000.0 |  |  | 298951577959936 | 289759260980622 |
| 15270000000.0 |  |  | 298945558117888 | 289759260980622 |
| 15280000000.0 |  |  | 298939546155520 | 289759260980622 |
| 15290000000.0 |  |  | 298933542056960 | 289759260980622 |
| 15300000000.0 |  |  | 298927545806336 | 289759260980622 |
| 15310000000.0 |  |  | 298921557389824 | 289759260980622 |
| 15320000000.0 |  |  | 298915576790528 | 289759260980622 |
| 15330000000.0 |  |  | 298909603994112 | 289759260980622 |
| 15340000000.0 |  |  | 298903638983680 | 289759260980622 |
| 15350000000.0 |  |  | 298897681745920 | 289759260980622 |
| 15360000000.0 |  |  | 298891732265472 | 289759260980622 |
| 15370000000.0 |  |  | 298885790525952 | 289759260980622 |
| 15380000000.0 |  |  | 298879856513536 | 289759260980622 |
| 15390000000.0 |  |  | 298873930211328 | 289759260980622 |
| 15400000000.0 |  |  | 298868011608064 | 289759260980622 |
| 15410000000.0 |  |  | 298862100684800 | 289759260980622 |
| 15420000000.0 |  |  | 298856197428224 | 289759260980622 |
| 15430000000.0 |  |  | 298850301822976 | 289759260980622 |
| 15440000000.0 |  |  | 298844413854720 | 289759260980622 |
| 15450000000.0 |  |  | 298838533509120 | 289759260980622 |
| 15460000000.0 |  |  | 298832660770816 | 289759260980622 |
| 15470000000.0 |  |  | 298826795622400 | 289759260980622 |
| 15480000000.0 |  |  | 298820938052608 | 289759260980622 |
| 15490000000.0 |  |  | 298815088047104 | 289759260980622 |
| 15500000000.0 |  |  | 298809245588480 | 289759260980622 |
| 15510000000.0 |  |  | 298803410665472 | 289759260980622 |
| 15520000000.0 |  |  | 298797583260672 | 289759260980622 |
| 15530000000.0 |  |  | 298791763361792 | 289759260980622 |
| 15540000000.0 |  |  | 298785950951424 | 289759260980622 |
| 15550000000.0 |  |  | 298780146017280 | 289759260980622 |
| 15560000000.0 |  |  | 298774348544000 | 289759260980622 |
| 15570000000.0 |  |  | 298768558519296 | 289759260980622 |
| 15580000000.0 |  |  | 298762775924736 | 289759260980622 |
| 15590000000.0 |  |  | 298757000751104 | 289759260980622 |
| 15600000000.0 |  |  | 298751232979968 | 289759260980622 |
| 15610000000.0 |  |  | 298745472599040 | 289759260980622 |
| 15620000000.0 |  |  | 298739719593984 | 289759260980622 |
| 15630000000.0 |  |  | 298733973948416 | 289759260980622 |
| 15640000000.0 |  |  | 298728235653120 | 289759260980622 |
| 15650000000.0 |  |  | 298722504689664 | 289759260980622 |
| 15660000000.0 |  |  | 298716781044736 | 289759260980622 |
| 15670000000.0 |  |  | 298711064707072 | 289759260980622 |
| 15680000000.0 |  |  | 298705355658240 | 289759260980622 |
| 15690000000.0 |  |  | 298699653889024 | 289759260980622 |
| 15700000000.0 |  |  | 298693959382016 | 289759260980622 |
| 15710000000.0 |  |  | 298688272123904 | 289759260980622 |
| 15720000000.0 |  |  | 298682592102400 | 289759260980622 |
| 15730000000.0 |  |  | 298676919303168 | 289759260980622 |
| 15740000000.0 |  |  | 298671253710848 | 289759260980622 |
| 15750000000.0 |  |  | 298665595314176 | 289759260980622 |
| 15760000000.0 |  |  | 298659944097792 | 289759260980622 |
| 15770000000.0 |  |  | 298654300048384 | 289759260980622 |
| 15780000000.0 |  |  | 298648663151616 | 289759260980622 |
| 15790000000.0 |  |  | 298643033393152 | 289759260980622 |
| 15800000000.0 |  |  | 298637410763776 | 289759260980622 |
| 15810000000.0 |  |  | 298631795246080 | 289759260980622 |
| 15820000000.0 |  |  | 298626186827776 | 289759260980622 |
| 15830000000.0 |  |  | 298620585495552 | 289759260980622 |
| 15840000000.0 |  |  | 298614991235072 | 289759260980622 |
| 15850000000.0 |  |  | 298609404035072 | 289759260980622 |
| 15860000000.0 |  |  | 298603823879168 | 289759260980622 |
| 15870000000.0 |  |  | 298598250755072 | 289759260980622 |
| 15880000000.0 |  |  | 298592684651520 | 289759260980622 |
| 15890000000.0 |  |  | 298587125554176 | 289759260980622 |
| 15900000000.0 |  |  | 298581573447680 | 289759260980622 |
| 15910000000.0 |  |  | 298576028321792 | 289759260980622 |
| 15920000000.0 |  |  | 298570490162176 | 289759260980622 |
| 15930000000.0 |  |  | 298564958953472 | 289759260980622 |
| 15940000000.0 |  |  | 298559434688512 | 289759260980622 |
| 15950000000.0 |  |  | 298553917345792 | 289759260980622 |
| 15960000000.0 |  |  | 298548406921216 | 289759260980622 |
| 15970000000.0 |  |  | 298542903395328 | 289759260980622 |
| 15980000000.0 |  |  | 298537406757888 | 289759260980622 |
| 15990000000.0 |  |  | 298531916995584 | 289759260980622 |
| 16000000000.0 |  |  | 298526434096128 | 289759260980622 |
| 16010000000.0 |  |  | 298520958045184 | 289759260980622 |
| 16020000000.0 |  |  | 298515488830464 | 289759260980622 |
| 16030000000.0 |  |  | 298510026439680 | 289759260980622 |
| 16040000000.0 |  |  | 298504570860544 | 289759260980622 |
| 16050000000.0 |  |  | 298499122079744 | 289759260980622 |
| 16060000000.0 |  |  | 298493680082944 | 289759260980622 |
| 16070000000.0 |  |  | 298488244860928 | 289759260980622 |
| 16080000000.0 |  |  | 298482816397312 | 289759260980622 |
| 16090000000.0 |  |  | 298477394682880 | 289759260980622 |
| 16100000000.0 |  |  | 298471979703296 | 289759260980622 |
| 16110000000.0 |  |  | 298466571445248 | 289759260980622 |
| 16120000000.0 |  |  | 298461169898496 | 289759260980622 |
| 16130000000.0 |  |  | 298455775047680 | 289759260980622 |
| 16140000000.0 |  |  | 298450386881536 | 289759260980622 |
| 16150000000.0 |  |  | 298445005389824 | 289759260980622 |
| 16160000000.0 |  |  | 298439630558208 | 289759260980622 |
| 16170000000.0 |  |  | 298434262374400 | 289759260980622 |
| 16180000000.0 |  |  | 298428900825088 | 289759260980622 |
| 16190000000.0 |  |  | 298423545900032 | 289759260980622 |
| 16200000000.0 |  |  | 298418197584896 | 289759260980622 |
| 16210000000.0 |  |  | 298412855870464 | 289759260980622 |
| 16220000000.0 |  |  | 298407520740352 | 289759260980622 |
| 16230000000.0 |  |  | 298402192185344 | 289759260980622 |
| 16240000000.0 |  |  | 298396870194176 | 289759260980622 |
| 16250000000.0 |  |  | 298391554750464 | 289759260980622 |
| 16260000000.0 |  |  | 298386245846016 | 289759260980622 |
| 16270000000.0 |  |  | 298380943467520 | 289759260980622 |
| 16280000000.0 |  |  | 298375647602688 | 289759260980622 |
| 16290000000.0 |  |  | 298370358240256 | 289759260980622 |
| 16300000000.0 |  |  | 298365075367936 | 289759260980622 |
| 16310000000.0 |  |  | 298359798973440 | 289759260980622 |
| 16320000000.0 |  |  | 298354529045504 | 289759260980622 |
| 16330000000.0 |  |  | 298349265571840 | 289759260980622 |
| 16340000000.0 |  |  | 298344008540160 | 289759260980622 |
| 16350000000.0 |  |  | 298338757939200 | 289759260980622 |
| 16360000000.0 |  |  | 298333513756672 | 289759260980622 |
| 16370000000.0 |  |  | 298328275982336 | 289759260980622 |
| 16380000000.0 |  |  | 298323044600832 | 289759260980622 |
| 16390000000.0 |  |  | 298317819604992 | 289759260980622 |
| 16400000000.0 |  |  | 298312600981504 | 289759260980622 |
| 16410000000.0 |  |  | 298307388718080 | 289759260980622 |
| 16420000000.0 |  |  | 298302182803456 | 289759260980622 |
| 16430000000.0 |  |  | 298296983224320 | 289759260980622 |
| 16440000000.0 |  |  | 298291789971456 | 289759260980622 |
| 16450000000.0 |  |  | 298286603033600 | 289759260980622 |
| 16460000000.0 |  |  | 298281422396416 | 289759260980622 |
| 16470000000.0 |  |  | 298276248051712 | 289759260980622 |
| 16480000000.0 |  |  | 298271079986176 | 289759260980622 |
| 16490000000.0 |  |  | 298265918188544 | 289759260980622 |
| 16500000000.0 |  |  | 298260762647552 | 289759260980622 |
| 16510000000.0 |  |  | 298255613350912 | 289759260980622 |
| 16520000000.0 |  |  | 298250470289408 | 289759260980622 |
| 16530000000.0 |  |  | 298245333449728 | 289759260980622 |
| 16540000000.0 |  |  | 298240202821632 | 289759260980622 |
| 16550000000.0 |  |  | 298235078394880 | 289759260980622 |
| 16560000000.0 |  |  | 298229960157184 | 289759260980622 |
| 16570000000.0 |  |  | 298224848096256 | 289759260980622 |
| 16580000000.0 |  |  | 298219742201856 | 289759260980622 |
| 16590000000.0 |  |  | 298214642462720 | 289759260980622 |
| 16600000000.0 |  |  | 298209548868608 | 289759260980622 |
| 16610000000.0 |  |  | 298204461407232 | 289759260980622 |
| 16620000000.0 |  |  | 298199380067328 | 289759260980622 |
| 16630000000.0 |  |  | 298194304839680 | 289759260980622 |
| 16640000000.0 |  |  | 298189235710976 | 289759260980622 |
| 16650000000.0 |  |  | 298184172672000 | 289759260980622 |
| 16660000000.0 |  |  | 298179115711488 | 289759260980622 |
| 16670000000.0 |  |  | 298174064816128 | 289759260980622 |
| 16680000000.0 |  |  | 298169019978752 | 289759260980622 |
| 16690000000.0 |  |  | 298163981186048 | 289759260980622 |
| 16700000000.0 |  |  | 298158948427776 | 289759260980622 |
| 16710000000.0 |  |  | 298153921692672 | 289759260980622 |
| 16720000000.0 |  |  | 298148900972544 | 289759260980622 |
| 16730000000.0 |  |  | 298143886253056 | 289759260980622 |
| 16740000000.0 |  |  | 298138877522944 | 289759260980622 |
| 16750000000.0 |  |  | 298133874775040 | 289759260980622 |
| 16760000000.0 |  |  | 298128877997056 | 289759260980622 |
| 16770000000.0 |  |  | 298123887178752 | 289759260980622 |
| 16780000000.0 |  |  | 298118902306816 | 289759260980622 |
| 16790000000.0 |  |  | 298113923376128 | 289759260980622 |
| 16800000000.0 |  |  | 298108950370304 | 289759260980622 |
| 16810000000.0 |  |  | 298103983283200 | 289759260980622 |
| 16820000000.0 |  |  | 298099022101504 | 289759260980622 |
| 16830000000.0 |  |  | 298094066812928 | 289759260980622 |
| 16840000000.0 |  |  | 298089117412352 | 289759260980622 |
| 16850000000.0 |  |  | 298084173886464 | 289759260980622 |
| 16860000000.0 |  |  | 298079236222976 | 289759260980622 |
| 16870000000.0 |  |  | 298074304414720 | 289759260980622 |
| 16880000000.0 |  |  | 298069378448384 | 289759260980622 |
| 16890000000.0 |  |  | 298064458316800 | 289759260980622 |
| 16900000000.0 |  |  | 298059544006656 | 289759260980622 |
| 16910000000.0 |  |  | 298054635508736 | 289759260980622 |
| 16920000000.0 |  |  | 298049732812800 | 289759260980622 |
| 16930000000.0 |  |  | 298044835909632 | 289759260980622 |
| 16940000000.0 |  |  | 298039944785920 | 289759260980622 |
| 16950000000.0 |  |  | 298035059435520 | 289759260980622 |
| 16960000000.0 |  |  | 298030179845120 | 289759260980622 |
| 16970000000.0 |  |  | 298025306006528 | 289759260980622 |
| 16980000000.0 |  |  | 298020437907456 | 289759260980622 |
| 16990000000.0 |  |  | 298015575538688 | 289759260980622 |
| 17000000000.0 |  |  | 298010718891008 | 289759260980622 |
| 17010000000.0 |  |  | 298005867953152 | 289759260980622 |
| 17020000000.0 |  |  | 298001022715904 | 289759260980622 |
| 17030000000.0 |  |  | 297996183170048 | 289759260980622 |
| 17040000000.0 |  |  | 297991349302272 | 289759260980622 |
| 17050000000.0 |  |  | 297986521106432 | 289759260980622 |
| 17060000000.0 |  |  | 297981698571264 | 289759260980622 |
| 17070000000.0 |  |  | 297976881683456 | 289759260980622 |
| 17080000000.0 |  |  | 297972070437888 | 289759260980622 |
| 17090000000.0 |  |  | 297967264823296 | 289759260980622 |
| 17100000000.0 |  |  | 297962464828416 | 289759260980622 |
| 17110000000.0 |  |  | 297957670444032 | 289759260980622 |
| 17120000000.0 |  |  | 297952881662976 | 289759260980622 |
| 17130000000.0 |  |  | 297948098469888 | 289759260980622 |
| 17140000000.0 |  |  | 297943320860672 | 289759260980622 |
| 17150000000.0 |  |  | 297938548819968 | 289759260980622 |
| 17160000000.0 |  |  | 297933782343680 | 289759260980622 |
| 17170000000.0 |  |  | 297929021419520 | 289759260980622 |
| 17180000000.0 |  |  | 297924266035200 | 289759260980622 |
| 17190000000.0 |  |  | 297919516185600 | 289759260980622 |
| 17200000000.0 |  |  | 297914771859456 | 289759260980622 |
| 17210000000.0 |  |  | 297910033045504 | 289759260980622 |
| 17220000000.0 |  |  | 297905299735552 | 289759260980622 |
| 17230000000.0 |  |  | 297900571919360 | 289759260980622 |
| 17240000000.0 |  |  | 297895849589760 | 289759260980622 |
| 17250000000.0 |  |  | 297891132734464 | 289759260980622 |
| 17260000000.0 |  |  | 297886421343232 | 289759260980622 |
| 17270000000.0 |  |  | 297881715409920 | 289759260980622 |
| 17280000000.0 |  |  | 297877014923264 | 289759260980622 |
| 17290000000.0 |  |  | 297872319874048 | 289759260980622 |
| 17300000000.0 |  |  | 297867630252032 | 289759260980622 |
| 17310000000.0 |  |  | 297862946046976 | 289759260980622 |
| 17320000000.0 |  |  | 297858267252736 | 289759260980622 |
| 17330000000.0 |  |  | 297853593858048 | 289759260980622 |
| 17340000000.0 |  |  | 297848925851648 | 289759260980622 |
| 17350000000.0 |  |  | 297844263229440 | 289759260980622 |
| 17360000000.0 |  |  | 297839605978112 | 289759260980622 |
| 17370000000.0 |  |  | 297834954087424 | 289759260980622 |
| 17380000000.0 |  |  | 297830307551232 | 289759260980622 |
| 17390000000.0 |  |  | 297825666358272 | 289759260980622 |
| 17400000000.0 |  |  | 297821030500352 | 289759260980622 |
| 17410000000.0 |  |  | 297816399968256 | 289759260980622 |
| 17420000000.0 |  |  | 297811774751744 | 289759260980622 |
| 17430000000.0 |  |  | 297807154842624 | 289759260980622 |
| 17440000000.0 |  |  | 297802540231680 | 289759260980622 |
| 17450000000.0 |  |  | 297797930909696 | 289759260980622 |
| 17460000000.0 |  |  | 297793326868480 | 289759260980622 |
| 17470000000.0 |  |  | 297788728095744 | 289759260980622 |
| 17480000000.0 |  |  | 297784134586368 | 289759260980622 |
| 17490000000.0 |  |  | 297779546329088 | 289759260980622 |
| 17500000000.0 |  |  | 297774963314688 | 289759260980622 |
| 17510000000.0 |  |  | 297770385537024 | 289759260980622 |
| 17520000000.0 |  |  | 297765812984832 | 289759260980622 |
| 17530000000.0 |  |  | 297761245648896 | 289759260980622 |
| 17540000000.0 |  |  | 297756683521024 | 289759260980622 |
| 17550000000.0 |  |  | 297752126592000 | 289759260980622 |
| 17560000000.0 |  |  | 297747574853632 | 289759260980622 |
| 17570000000.0 |  |  | 297743028295680 | 289759260980622 |
| 17580000000.0 |  |  | 297738486909952 | 289759260980622 |
| 17590000000.0 |  |  | 297733950688256 | 289759260980622 |
| 17600000000.0 |  |  | 297729419622400 | 289759260980622 |
| 17610000000.0 |  |  | 297724893701120 | 289759260980622 |
| 17620000000.0 |  |  | 297720372918272 | 289759260980622 |
| 17630000000.0 |  |  | 297715857262592 | 289759260980622 |
| 17640000000.0 |  |  | 297711346727936 | 289759260980622 |
| 17650000000.0 |  |  | 297706841304064 | 289759260980622 |
| 17660000000.0 |  |  | 297702340980736 | 289759260980622 |
| 17670000000.0 |  |  | 297697845753856 | 289759260980622 |
| 17680000000.0 |  |  | 297693355610112 | 289759260980622 |
| 17690000000.0 |  |  | 297688870544384 | 289759260980622 |
| 17700000000.0 |  |  | 297684390545408 | 289759260980622 |
| 17710000000.0 |  |  | 297679915603968 | 289759260980622 |
| 17720000000.0 |  |  | 297675445715968 | 289759260980622 |
| 17730000000.0 |  |  | 297670980869120 | 289759260980622 |
| 17740000000.0 |  |  | 297666521055232 | 289759260980622 |
| 17750000000.0 |  |  | 297662066269184 | 289759260980622 |
| 17760000000.0 |  |  | 297657616497664 | 289759260980622 |
| 17770000000.0 |  |  | 297653171735552 | 289759260980622 |
| 17780000000.0 |  |  | 297648731972608 | 289759260980622 |
| 17790000000.0 |  |  | 297644297198592 | 289759260980622 |
| 17800000000.0 |  |  | 297639867410432 | 289759260980622 |
| 17810000000.0 |  |  | 297635442596864 | 289759260980622 |
| 17820000000.0 |  |  | 297631022747648 | 289759260980622 |
| 17830000000.0 |  |  | 297626607856640 | 289759260980622 |
| 17840000000.0 |  |  | 297622197915648 | 289759260980622 |
| 17850000000.0 |  |  | 297617792915456 | 289759260980622 |
| 17860000000.0 |  |  | 297613392848896 | 289759260980622 |
| 17870000000.0 |  |  | 297608997704704 | 289759260980622 |
| 17880000000.0 |  |  | 297604607478784 | 289759260980622 |
| 17890000000.0 |  |  | 297600222159872 | 289759260980622 |
| 17900000000.0 |  |  | 297595841740800 | 289759260980622 |
| 17910000000.0 |  |  | 297591466214400 | 289759260980622 |
| 17920000000.0 |  |  | 297587095570432 | 289759260980622 |
| 17930000000.0 |  |  | 297582729801728 | 289759260980622 |
| 17940000000.0 |  |  | 297578368900096 | 289759260980622 |
| 17950000000.0 |  |  | 297574012856320 | 289759260980622 |
| 17960000000.0 |  |  | 297569661664256 | 289759260980622 |
| 17970000000.0 |  |  | 297565315315712 | 289759260980622 |
| 17980000000.0 |  |  | 297560973800448 | 289759260980622 |
| 17990000000.0 |  |  | 297556637113344 | 289759260980622 |
| 18000000000.0 |  |  | 297552305244160 | 289759260980622 |
| 18010000000.0 |  |  | 297547978184704 | 289759260980622 |
| 18020000000.0 |  |  | 297543655928832 | 289759260980622 |
| 18030000000.0 |  |  | 297539338467328 | 289759260980622 |
| 18040000000.0 |  |  | 297535025792000 | 289759260980622 |
| 18050000000.0 |  |  | 297530717894656 | 289759260980622 |
| 18060000000.0 |  |  | 297526414768128 | 289759260980622 |
| 18070000000.0 |  |  | 297522116405248 | 289759260980622 |
| 18080000000.0 |  |  | 297517822796800 | 289759260980622 |
| 18090000000.0 |  |  | 297513533936640 | 289759260980622 |
| 18100000000.0 |  |  | 297509249813504 | 289759260980622 |
| 18110000000.0 |  |  | 297504970421248 | 289759260980622 |
| 18120000000.0 |  |  | 297500695753728 | 289759260980622 |
| 18130000000.0 |  |  | 297496425801728 | 289759260980622 |
| 18140000000.0 |  |  | 297492160556032 | 289759260980622 |
| 18150000000.0 |  |  | 297487900012544 | 289759260980622 |
| 18160000000.0 |  |  | 297483644160000 | 289759260980622 |
| 18170000000.0 |  |  | 297479392991232 | 289759260980622 |
| 18180000000.0 |  |  | 297475146501120 | 289759260980622 |
| 18190000000.0 |  |  | 297470904677376 | 289759260980622 |
| 18200000000.0 |  |  | 297466667515904 | 289759260980622 |
| 18210000000.0 |  |  | 297462435009536 | 289759260980622 |
| 18220000000.0 |  |  | 297458207148032 | 289759260980622 |
| 18230000000.0 |  |  | 297453983925248 | 289759260980622 |
| 18240000000.0 |  |  | 297449765332992 | 289759260980622 |
| 18250000000.0 |  |  | 297445551365120 | 289759260980622 |
| 18260000000.0 |  |  | 297441342011392 | 289759260980622 |
| 18270000000.0 |  |  | 297437137264640 | 289759260980622 |
| 18280000000.0 |  |  | 297432937119744 | 289759260980622 |
| 18290000000.0 |  |  | 297428741567488 | 289759260980622 |
| 18300000000.0 |  |  | 297424550599680 | 289759260980622 |
| 18310000000.0 |  |  | 297420364210176 | 289759260980622 |
| 18320000000.0 |  |  | 297416182391808 | 289759260980622 |
| 18330000000.0 |  |  | 297412005136384 | 289759260980622 |
| 18340000000.0 |  |  | 297407832435712 | 289759260980622 |
| 18350000000.0 |  |  | 297403664280576 | 289759260980622 |
| 18360000000.0 |  |  | 297399500668928 | 289759260980622 |
| 18370000000.0 |  |  | 297395341590528 | 289759260980622 |
| 18380000000.0 |  |  | 297391187035136 | 289759260980622 |
| 18390000000.0 |  |  | 297387037000704 | 289759260980622 |
| 18400000000.0 |  |  | 297382891475968 | 289759260980622 |
| 18410000000.0 |  |  | 297378750454784 | 289759260980622 |
| 18420000000.0 |  |  | 297374613929984 | 289759260980622 |
| 18430000000.0 |  |  | 297370481891328 | 289759260980622 |
| 18440000000.0 |  |  | 297366354337792 | 289759260980622 |
| 18450000000.0 |  |  | 297362231258112 | 289759260980622 |
| 18460000000.0 |  |  | 297358112645120 | 289759260980622 |
| 18470000000.0 |  |  | 297353998491648 | 289759260980622 |
| 18480000000.0 |  |  | 297349888791552 | 289759260980622 |
| 18490000000.0 |  |  | 297345783535616 | 289759260980622 |
| 18500000000.0 |  |  | 297341682718720 | 289759260980622 |
| 18510000000.0 |  |  | 297337586331648 | 289759260980622 |
| 18520000000.0 |  |  | 297333494369280 | 289759260980622 |
| 18530000000.0 |  |  | 297329406823424 | 289759260980622 |
| 18540000000.0 |  |  | 297325323685888 | 289759260980622 |
| 18550000000.0 |  |  | 297321244951552 | 289759260980622 |
| 18560000000.0 |  |  | 297317170612224 | 289759260980622 |
| 18570000000.0 |  |  | 297313100661760 | 289759260980622 |
| 18580000000.0 |  |  | 297309035090944 | 289759260980622 |
| 18590000000.0 |  |  | 297304973894656 | 289759260980622 |
| 18600000000.0 |  |  | 297300917065728 | 289759260980622 |
| 18610000000.0 |  |  | 297296864595968 | 289759260980622 |
| 18620000000.0 |  |  | 297292816479232 | 289759260980622 |
| 18630000000.0 |  |  | 297288772708352 | 289759260980622 |
| 18640000000.0 |  |  | 297284733276160 | 289759260980622 |
| 18650000000.0 |  |  | 297280698175488 | 289759260980622 |
| 18660000000.0 |  |  | 297276667400192 | 289759260980622 |
| 18670000000.0 |  |  | 297272640942080 | 289759260980622 |
| 18680000000.0 |  |  | 297268618795008 | 289759260980622 |
| 18690000000.0 |  |  | 297264600952832 | 289759260980622 |
| 18700000000.0 |  |  | 297260587407360 | 289759260980622 |
| 18710000000.0 |  |  | 297256578151424 | 289759260980622 |
| 18720000000.0 |  |  | 297252573179904 | 289759260980622 |
| 18730000000.0 |  |  | 297248572485632 | 289759260980622 |
| 18740000000.0 |  |  | 297244576060416 | 289759260980622 |
| 18750000000.0 |  |  | 297240583897088 | 289759260980622 |
| 18760000000.0 |  |  | 297236595989504 | 289759260980622 |
| 18770000000.0 |  |  | 297232612332544 | 289759260980622 |
| 18780000000.0 |  |  | 297228632916992 | 289759260980622 |
| 18790000000.0 |  |  | 297224657738752 | 289759260980622 |
| 18800000000.0 |  |  | 297220686787584 | 289759260980622 |
| 18810000000.0 |  |  | 297216720059392 | 289759260980622 |
| 18820000000.0 |  |  | 297212757547008 | 289759260980622 |
| 18830000000.0 |  |  | 297208799242240 | 289759260980622 |
| 18840000000.0 |  |  | 297204845140992 | 289759260980622 |
| 18850000000.0 |  |  | 297200895235072 | 289759260980622 |
| 18860000000.0 |  |  | 297196949515264 | 289759260980622 |
| 18870000000.0 |  |  | 297193007979520 | 289759260980622 |
| 18880000000.0 |  |  | 297189070618624 | 289759260980622 |
| 18890000000.0 |  |  | 297185137427456 | 289759260980622 |
| 18900000000.0 |  |  | 297181208396800 | 289759260980622 |
| 18910000000.0 |  |  | 297177283521536 | 289759260980622 |
| 18920000000.0 |  |  | 297173362796544 | 289759260980622 |
| 18930000000.0 |  |  | 297169446212608 | 289759260980622 |
| 18940000000.0 |  |  | 297165533764608 | 289759260980622 |
| 18950000000.0 |  |  | 297161625447424 | 289759260980622 |
| 18960000000.0 |  |  | 297157721250816 | 289759260980622 |
| 18970000000.0 |  |  | 297153821172736 | 289759260980622 |
| 18980000000.0 |  |  | 297149925202944 | 289759260980622 |
| 18990000000.0 |  |  | 297146033335296 | 289759260980622 |
| 19000000000.0 |  |  | 297142145565696 | 289759260980622 |
| 19010000000.0 |  |  | 297138261886976 | 289759260980622 |
| 19020000000.0 |  |  | 297134382289920 | 289759260980622 |
| 19030000000.0 |  |  | 297130506771456 | 289759260980622 |
| 19040000000.0 |  |  | 297126635324416 | 289759260980622 |
| 19050000000.0 |  |  | 297122767941632 | 289759260980622 |
| 19060000000.0 |  |  | 297118904616960 | 289759260980622 |
| 19070000000.0 |  |  | 297115045343232 | 289759260980622 |
| 19080000000.0 |  |  | 297111190115328 | 289759260980622 |
| 19090000000.0 |  |  | 297107338926080 | 289759260980622 |
| 19100000000.0 |  |  | 297103491770368 | 289759260980622 |
| 19110000000.0 |  |  | 297099648640000 | 289759260980622 |
| 19120000000.0 |  |  | 297095809530880 | 289759260980622 |
| 19130000000.0 |  |  | 297091974433792 | 289759260980622 |
| 19140000000.0 |  |  | 297088143345664 | 289759260980622 |
| 19150000000.0 |  |  | 297084316256256 | 289759260980622 |
| 19160000000.0 |  |  | 297080493163520 | 289759260980622 |
| 19170000000.0 |  |  | 297076674060288 | 289759260980622 |
| 19180000000.0 |  |  | 297072858937344 | 289759260980622 |
| 19190000000.0 |  |  | 297069047791616 | 289759260980622 |
| 19200000000.0 |  |  | 297065240616960 | 289759260980622 |
| 19210000000.0 |  |  | 297061437404160 | 289759260980622 |
| 19220000000.0 |  |  | 297057638150144 | 289759260980622 |
| 19230000000.0 |  |  | 297053842845696 | 289759260980622 |
| 19240000000.0 |  |  | 297050051488768 | 289759260980622 |
| 19250000000.0 |  |  | 297046264070144 | 289759260980622 |
| 19260000000.0 |  |  | 297042480583680 | 289759260980622 |
| 19270000000.0 |  |  | 297038701025280 | 289759260980622 |
| 19280000000.0 |  |  | 297034925386752 | 289759260980622 |
| 19290000000.0 |  |  | 297031153662976 | 289759260980622 |
| 19300000000.0 |  |  | 297027385847808 | 289759260980622 |
| 19310000000.0 |  |  | 297023621934080 | 289759260980622 |
| 19320000000.0 |  |  | 297019861918720 | 289759260980622 |
| 19330000000.0 |  |  | 297016105792512 | 289759260980622 |
| 19340000000.0 |  |  | 297012353549312 | 289759260980622 |
| 19350000000.0 |  |  | 297008605187072 | 289759260980622 |
| 19360000000.0 |  |  | 297004860695552 | 289759260980622 |
| 19370000000.0 |  |  | 297001120070656 | 289759260980622 |
| 19380000000.0 |  |  | 296997383306240 | 289759260980622 |
| 19390000000.0 |  |  | 296993650393088 | 289759260980622 |
| 19400000000.0 |  |  | 296989921332224 | 289759260980622 |
| 19410000000.0 |  |  | 296986196113408 | 289759260980622 |
| 19420000000.0 |  |  | 296982474729472 | 289759260980622 |
| 19430000000.0 |  |  | 296978757176320 | 289759260980622 |
| 19440000000.0 |  |  | 296975043448832 | 289759260980622 |
| 19450000000.0 |  |  | 296971333539840 | 289759260980622 |
| 19460000000.0 |  |  | 296967627443200 | 289759260980622 |
| 19470000000.0 |  |  | 296963925153792 | 289759260980622 |
| 19480000000.0 |  |  | 296960226665472 | 289759260980622 |
| 19490000000.0 |  |  | 296956531973120 | 289759260980622 |
| 19500000000.0 |  |  | 296952841067520 | 289759260980622 |
| 19510000000.0 |  |  | 296949153948672 | 289759260980622 |
| 19520000000.0 |  |  | 296945470607360 | 289759260980622 |
| 19530000000.0 |  |  | 296941791037440 | 289759260980622 |
| 19540000000.0 |  |  | 296938115232768 | 289759260980622 |
| 19550000000.0 |  |  | 296934443188224 | 289759260980622 |
| 19560000000.0 |  |  | 296930774899712 | 289759260980622 |
| 19570000000.0 |  |  | 296927110360064 | 289759260980622 |
| 19580000000.0 |  |  | 296923449562112 | 289759260980622 |
| 19590000000.0 |  |  | 296919792502784 | 289759260980622 |
| 19600000000.0 |  |  | 296916139174912 | 289759260980622 |
| 19610000000.0 |  |  | 296912489573376 | 289759260980622 |
| 19620000000.0 |  |  | 296908843692032 | 289759260980622 |
| 19630000000.0 |  |  | 296905201522688 | 289759260980622 |
| 19640000000.0 |  |  | 296901563065344 | 289759260980622 |
| 19650000000.0 |  |  | 296897928309760 | 289759260980622 |
| 19660000000.0 |  |  | 296894297251840 | 289759260980622 |
| 19670000000.0 |  |  | 296890669888512 | 289759260980622 |
| 19680000000.0 |  |  | 296887046208512 | 289759260980622 |
| 19690000000.0 |  |  | 296883426210816 | 289759260980622 |
| 19700000000.0 |  |  | 296879809888256 | 289759260980622 |
| 19710000000.0 |  |  | 296876197234688 | 289759260980622 |
| 19720000000.0 |  |  | 296872588243968 | 289759260980622 |
| 19730000000.0 |  |  | 296868982913024 | 289759260980622 |
| 19740000000.0 |  |  | 296865381233664 | 289759260980622 |
| 19750000000.0 |  |  | 296861783202816 | 289759260980622 |
| 19760000000.0 |  |  | 296858188813312 | 289759260980622 |
| 19770000000.0 |  |  | 296854598061056 | 289759260980622 |
| 19780000000.0 |  |  | 296851010937856 | 289759260980622 |
| 19790000000.0 |  |  | 296847427439616 | 289759260980622 |
| 19800000000.0 |  |  | 296843847563264 | 289759260980622 |
| 19810000000.0 |  |  | 296840271298560 | 289759260980622 |
| 19820000000.0 |  |  | 296836698644480 | 289759260980622 |
| 19830000000.0 |  |  | 296833129592832 | 289759260980622 |
| 19840000000.0 |  |  | 296829564139520 | 289759260980622 |
| 19850000000.0 |  |  | 296826002278400 | 289759260980622 |
| 19860000000.0 |  |  | 296822444004352 | 289759260980622 |
| 19870000000.0 |  |  | 296818889309184 | 289759260980622 |
| 19880000000.0 |  |  | 296815338192896 | 289759260980622 |
| 19890000000.0 |  |  | 296811790647296 | 289759260980622 |
| 19900000000.0 |  |  | 296808246666240 | 289759260980622 |
| 19910000000.0 |  |  | 296804706245632 | 289759260980622 |
| 19920000000.0 |  |  | 296801169380352 | 289759260980622 |
| 19930000000.0 |  |  | 296797636063232 | 289759260980622 |
| 19940000000.0 |  |  | 296794106291200 | 289759260980622 |
| 19950000000.0 |  |  | 296790580056064 | 289759260980622 |
| 19960000000.0 |  |  | 296787057355776 | 289759260980622 |
| 19970000000.0 |  |  | 296783538183168 | 289759260980622 |
| 19980000000.0 |  |  | 296780022532096 | 289759260980622 |
| 19990000000.0 |  |  | 296776510400512 | 289759260980622 |
| 20000000000.0 |  |  | 296773001779200 | 289759260980622 |